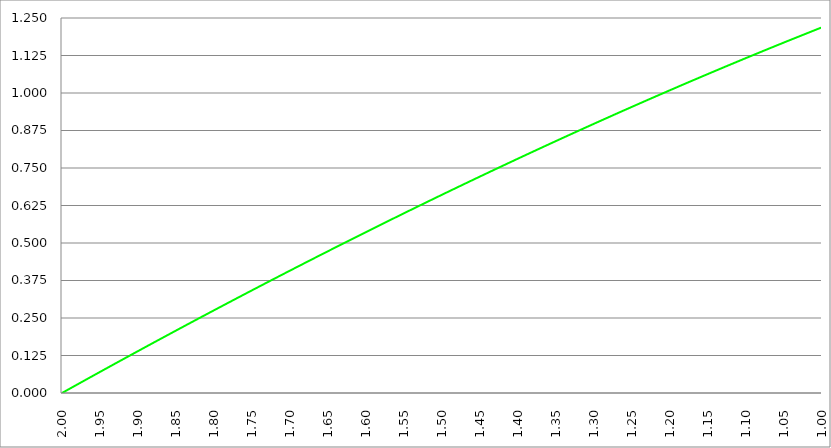
| Category | Series 1 | Series 0 | Series 2 |
|---|---|---|---|
| 2.0 |  | 0 |  |
| 1.9995 |  | 0.001 |  |
| 1.999 |  | 0.001 |  |
| 1.9985 |  | 0.002 |  |
| 1.998 |  | 0.003 |  |
| 1.9975 |  | 0.004 |  |
| 1.997 |  | 0.004 |  |
| 1.9965 |  | 0.005 |  |
| 1.996 |  | 0.006 |  |
| 1.9955 |  | 0.006 |  |
| 1.995000000000001 |  | 0.007 |  |
| 1.994500000000001 |  | 0.008 |  |
| 1.994000000000001 |  | 0.008 |  |
| 1.993500000000001 |  | 0.009 |  |
| 1.993000000000001 |  | 0.01 |  |
| 1.992500000000001 |  | 0.011 |  |
| 1.992000000000001 |  | 0.011 |  |
| 1.991500000000001 |  | 0.012 |  |
| 1.991000000000001 |  | 0.013 |  |
| 1.990500000000001 |  | 0.013 |  |
| 1.990000000000001 |  | 0.014 |  |
| 1.989500000000001 |  | 0.015 |  |
| 1.989000000000001 |  | 0.016 |  |
| 1.988500000000001 |  | 0.016 |  |
| 1.988000000000001 |  | 0.017 |  |
| 1.987500000000001 |  | 0.018 |  |
| 1.987000000000001 |  | 0.018 |  |
| 1.986500000000001 |  | 0.019 |  |
| 1.986000000000002 |  | 0.02 |  |
| 1.985500000000002 |  | 0.02 |  |
| 1.985000000000002 |  | 0.021 |  |
| 1.984500000000002 |  | 0.022 |  |
| 1.984000000000002 |  | 0.023 |  |
| 1.983500000000002 |  | 0.023 |  |
| 1.983000000000002 |  | 0.024 |  |
| 1.982500000000002 |  | 0.025 |  |
| 1.982000000000002 |  | 0.025 |  |
| 1.981500000000002 |  | 0.026 |  |
| 1.981000000000002 |  | 0.027 |  |
| 1.980500000000002 |  | 0.028 |  |
| 1.980000000000002 |  | 0.028 |  |
| 1.979500000000002 |  | 0.029 |  |
| 1.979000000000002 |  | 0.03 |  |
| 1.978500000000002 |  | 0.03 |  |
| 1.978000000000002 |  | 0.031 |  |
| 1.977500000000002 |  | 0.032 |  |
| 1.977000000000003 |  | 0.032 |  |
| 1.976500000000003 |  | 0.033 |  |
| 1.976000000000003 |  | 0.034 |  |
| 1.975500000000003 |  | 0.035 |  |
| 1.975000000000003 |  | 0.035 |  |
| 1.974500000000003 |  | 0.036 |  |
| 1.974000000000003 |  | 0.037 |  |
| 1.973500000000003 |  | 0.037 |  |
| 1.973000000000003 |  | 0.038 |  |
| 1.972500000000003 |  | 0.039 |  |
| 1.972000000000003 |  | 0.039 |  |
| 1.971500000000003 |  | 0.04 |  |
| 1.971000000000003 |  | 0.041 |  |
| 1.970500000000003 |  | 0.042 |  |
| 1.970000000000003 |  | 0.042 |  |
| 1.969500000000003 |  | 0.043 |  |
| 1.969000000000003 |  | 0.044 |  |
| 1.968500000000003 |  | 0.044 |  |
| 1.968000000000003 |  | 0.045 |  |
| 1.967500000000004 |  | 0.046 |  |
| 1.967000000000004 |  | 0.046 |  |
| 1.966500000000004 |  | 0.047 |  |
| 1.966000000000004 |  | 0.048 |  |
| 1.965500000000004 |  | 0.049 |  |
| 1.965000000000004 |  | 0.049 |  |
| 1.964500000000004 |  | 0.05 |  |
| 1.964000000000004 |  | 0.051 |  |
| 1.963500000000004 |  | 0.051 |  |
| 1.963000000000004 |  | 0.052 |  |
| 1.962500000000004 |  | 0.053 |  |
| 1.962000000000004 |  | 0.053 |  |
| 1.961500000000004 |  | 0.054 |  |
| 1.961000000000004 |  | 0.055 |  |
| 1.960500000000004 |  | 0.056 |  |
| 1.960000000000004 |  | 0.056 |  |
| 1.959500000000004 |  | 0.057 |  |
| 1.959000000000004 |  | 0.058 |  |
| 1.958500000000005 |  | 0.058 |  |
| 1.958000000000005 |  | 0.059 |  |
| 1.957500000000005 |  | 0.06 |  |
| 1.957000000000005 |  | 0.06 |  |
| 1.956500000000005 |  | 0.061 |  |
| 1.956000000000005 |  | 0.062 |  |
| 1.955500000000005 |  | 0.063 |  |
| 1.955000000000005 |  | 0.063 |  |
| 1.954500000000005 |  | 0.064 |  |
| 1.954000000000005 |  | 0.065 |  |
| 1.953500000000005 |  | 0.065 |  |
| 1.953000000000005 |  | 0.066 |  |
| 1.952500000000005 |  | 0.067 |  |
| 1.952000000000005 |  | 0.067 |  |
| 1.951500000000005 |  | 0.068 |  |
| 1.951000000000005 |  | 0.069 |  |
| 1.950500000000005 |  | 0.07 |  |
| 1.950000000000005 |  | 0.07 |  |
| 1.949500000000006 |  | 0.071 |  |
| 1.949000000000006 |  | 0.072 |  |
| 1.948500000000006 |  | 0.072 |  |
| 1.948000000000006 |  | 0.073 |  |
| 1.947500000000006 |  | 0.074 |  |
| 1.947000000000006 |  | 0.074 |  |
| 1.946500000000006 |  | 0.075 |  |
| 1.946000000000006 |  | 0.076 |  |
| 1.945500000000006 |  | 0.077 |  |
| 1.945000000000006 |  | 0.077 |  |
| 1.944500000000006 |  | 0.078 |  |
| 1.944000000000006 |  | 0.079 |  |
| 1.943500000000006 |  | 0.079 |  |
| 1.943000000000006 |  | 0.08 |  |
| 1.942500000000006 |  | 0.081 |  |
| 1.942000000000006 |  | 0.081 |  |
| 1.941500000000006 |  | 0.082 |  |
| 1.941000000000006 |  | 0.083 |  |
| 1.940500000000007 |  | 0.084 |  |
| 1.940000000000007 |  | 0.084 |  |
| 1.939500000000007 |  | 0.085 |  |
| 1.939000000000007 |  | 0.086 |  |
| 1.938500000000007 |  | 0.086 |  |
| 1.938000000000007 |  | 0.087 |  |
| 1.937500000000007 |  | 0.088 |  |
| 1.937000000000007 |  | 0.088 |  |
| 1.936500000000007 |  | 0.089 |  |
| 1.936000000000007 |  | 0.09 |  |
| 1.935500000000007 |  | 0.09 |  |
| 1.935000000000007 |  | 0.091 |  |
| 1.934500000000007 |  | 0.092 |  |
| 1.934000000000007 |  | 0.093 |  |
| 1.933500000000007 |  | 0.093 |  |
| 1.933000000000007 |  | 0.094 |  |
| 1.932500000000007 |  | 0.095 |  |
| 1.932000000000007 |  | 0.095 |  |
| 1.931500000000008 |  | 0.096 |  |
| 1.931000000000008 |  | 0.097 |  |
| 1.930500000000008 |  | 0.097 |  |
| 1.930000000000008 |  | 0.098 |  |
| 1.929500000000008 |  | 0.099 |  |
| 1.929000000000008 |  | 0.1 |  |
| 1.928500000000008 |  | 0.1 |  |
| 1.928000000000008 |  | 0.101 |  |
| 1.927500000000008 |  | 0.102 |  |
| 1.927000000000008 |  | 0.102 |  |
| 1.926500000000008 |  | 0.103 |  |
| 1.926000000000008 |  | 0.104 |  |
| 1.925500000000008 |  | 0.104 |  |
| 1.925000000000008 |  | 0.105 |  |
| 1.924500000000008 |  | 0.106 |  |
| 1.924000000000008 |  | 0.106 |  |
| 1.923500000000008 |  | 0.107 |  |
| 1.923000000000008 |  | 0.108 |  |
| 1.922500000000009 |  | 0.109 |  |
| 1.922000000000009 |  | 0.109 |  |
| 1.921500000000009 |  | 0.11 |  |
| 1.921000000000009 |  | 0.111 |  |
| 1.920500000000009 |  | 0.111 |  |
| 1.920000000000009 |  | 0.112 |  |
| 1.919500000000009 |  | 0.113 |  |
| 1.919000000000009 |  | 0.113 |  |
| 1.918500000000009 |  | 0.114 |  |
| 1.91800000000001 |  | 0.115 |  |
| 1.917500000000009 |  | 0.115 |  |
| 1.917000000000009 |  | 0.116 |  |
| 1.916500000000009 |  | 0.117 |  |
| 1.916000000000009 |  | 0.118 |  |
| 1.915500000000009 |  | 0.118 |  |
| 1.915000000000009 |  | 0.119 |  |
| 1.914500000000009 |  | 0.12 |  |
| 1.914000000000009 |  | 0.12 |  |
| 1.91350000000001 |  | 0.121 |  |
| 1.91300000000001 |  | 0.122 |  |
| 1.91250000000001 |  | 0.122 |  |
| 1.91200000000001 |  | 0.123 |  |
| 1.91150000000001 |  | 0.124 |  |
| 1.91100000000001 |  | 0.124 |  |
| 1.91050000000001 |  | 0.125 |  |
| 1.91000000000001 |  | 0.126 |  |
| 1.90950000000001 |  | 0.127 |  |
| 1.90900000000001 |  | 0.127 |  |
| 1.90850000000001 |  | 0.128 |  |
| 1.90800000000001 |  | 0.129 |  |
| 1.90750000000001 |  | 0.129 |  |
| 1.90700000000001 |  | 0.13 |  |
| 1.90650000000001 |  | 0.131 |  |
| 1.90600000000001 |  | 0.131 |  |
| 1.90550000000001 |  | 0.132 |  |
| 1.90500000000001 |  | 0.133 |  |
| 1.90450000000001 |  | 0.133 |  |
| 1.904000000000011 |  | 0.134 |  |
| 1.903500000000011 |  | 0.135 |  |
| 1.903000000000011 |  | 0.136 |  |
| 1.902500000000011 |  | 0.136 |  |
| 1.902000000000011 |  | 0.137 |  |
| 1.901500000000011 |  | 0.138 |  |
| 1.901000000000011 |  | 0.138 |  |
| 1.900500000000011 |  | 0.139 |  |
| 1.900000000000011 |  | 0.14 |  |
| 1.899500000000011 |  | 0.14 |  |
| 1.899000000000011 |  | 0.141 |  |
| 1.898500000000011 |  | 0.142 |  |
| 1.898000000000011 |  | 0.142 |  |
| 1.897500000000011 |  | 0.143 |  |
| 1.897000000000011 |  | 0.144 |  |
| 1.896500000000011 |  | 0.144 |  |
| 1.896000000000011 |  | 0.145 |  |
| 1.895500000000011 |  | 0.146 |  |
| 1.895000000000011 |  | 0.147 |  |
| 1.894500000000012 |  | 0.147 |  |
| 1.894000000000012 |  | 0.148 |  |
| 1.893500000000012 |  | 0.149 |  |
| 1.893000000000012 |  | 0.149 |  |
| 1.892500000000012 |  | 0.15 |  |
| 1.892000000000012 |  | 0.151 |  |
| 1.891500000000012 |  | 0.151 |  |
| 1.891000000000012 |  | 0.152 |  |
| 1.890500000000012 |  | 0.153 |  |
| 1.890000000000012 |  | 0.153 |  |
| 1.889500000000012 |  | 0.154 |  |
| 1.889000000000012 |  | 0.155 |  |
| 1.888500000000012 |  | 0.155 |  |
| 1.888000000000012 |  | 0.156 |  |
| 1.887500000000012 |  | 0.157 |  |
| 1.887000000000012 |  | 0.158 |  |
| 1.886500000000012 |  | 0.158 |  |
| 1.886000000000012 |  | 0.159 |  |
| 1.885500000000013 |  | 0.16 |  |
| 1.885000000000013 |  | 0.16 |  |
| 1.884500000000013 |  | 0.161 |  |
| 1.884000000000013 |  | 0.162 |  |
| 1.883500000000013 |  | 0.162 |  |
| 1.883000000000013 |  | 0.163 |  |
| 1.882500000000013 |  | 0.164 |  |
| 1.882000000000013 |  | 0.164 |  |
| 1.881500000000013 |  | 0.165 |  |
| 1.881000000000013 |  | 0.166 |  |
| 1.880500000000013 |  | 0.166 |  |
| 1.880000000000013 |  | 0.167 |  |
| 1.879500000000013 |  | 0.168 |  |
| 1.879000000000013 |  | 0.169 |  |
| 1.878500000000013 |  | 0.169 |  |
| 1.878000000000013 |  | 0.17 |  |
| 1.877500000000013 |  | 0.171 |  |
| 1.877000000000013 |  | 0.171 |  |
| 1.876500000000014 |  | 0.172 |  |
| 1.876000000000014 |  | 0.173 |  |
| 1.875500000000014 |  | 0.173 |  |
| 1.875000000000014 |  | 0.174 |  |
| 1.874500000000014 |  | 0.175 |  |
| 1.874000000000014 |  | 0.175 |  |
| 1.873500000000014 |  | 0.176 |  |
| 1.873000000000014 |  | 0.177 |  |
| 1.872500000000014 |  | 0.177 |  |
| 1.872000000000014 |  | 0.178 |  |
| 1.871500000000014 |  | 0.179 |  |
| 1.871000000000014 |  | 0.179 |  |
| 1.870500000000014 |  | 0.18 |  |
| 1.870000000000014 |  | 0.181 |  |
| 1.869500000000014 |  | 0.182 |  |
| 1.869000000000014 |  | 0.182 |  |
| 1.868500000000014 |  | 0.183 |  |
| 1.868000000000014 |  | 0.184 |  |
| 1.867500000000015 |  | 0.184 |  |
| 1.867000000000015 |  | 0.185 |  |
| 1.866500000000015 |  | 0.186 |  |
| 1.866000000000015 |  | 0.186 |  |
| 1.865500000000015 |  | 0.187 |  |
| 1.865000000000015 |  | 0.188 |  |
| 1.864500000000015 |  | 0.188 |  |
| 1.864000000000015 |  | 0.189 |  |
| 1.863500000000015 |  | 0.19 |  |
| 1.863000000000015 |  | 0.19 |  |
| 1.862500000000015 |  | 0.191 |  |
| 1.862000000000015 |  | 0.192 |  |
| 1.861500000000015 |  | 0.192 |  |
| 1.861000000000015 |  | 0.193 |  |
| 1.860500000000015 |  | 0.194 |  |
| 1.860000000000015 |  | 0.194 |  |
| 1.859500000000015 |  | 0.195 |  |
| 1.859000000000015 |  | 0.196 |  |
| 1.858500000000016 |  | 0.197 |  |
| 1.858000000000016 |  | 0.197 |  |
| 1.857500000000016 |  | 0.198 |  |
| 1.857000000000016 |  | 0.199 |  |
| 1.856500000000016 |  | 0.199 |  |
| 1.856000000000016 |  | 0.2 |  |
| 1.855500000000016 |  | 0.201 |  |
| 1.855000000000016 |  | 0.201 |  |
| 1.854500000000016 |  | 0.202 |  |
| 1.854000000000016 |  | 0.203 |  |
| 1.853500000000016 |  | 0.203 |  |
| 1.853000000000016 |  | 0.204 |  |
| 1.852500000000016 |  | 0.205 |  |
| 1.852000000000016 |  | 0.205 |  |
| 1.851500000000016 |  | 0.206 |  |
| 1.851000000000016 |  | 0.207 |  |
| 1.850500000000016 |  | 0.207 |  |
| 1.850000000000016 |  | 0.208 |  |
| 1.849500000000017 |  | 0.209 |  |
| 1.849000000000017 |  | 0.209 |  |
| 1.848500000000017 |  | 0.21 |  |
| 1.848000000000017 |  | 0.211 |  |
| 1.847500000000017 |  | 0.212 |  |
| 1.847000000000017 |  | 0.212 |  |
| 1.846500000000017 |  | 0.213 |  |
| 1.846000000000017 |  | 0.214 |  |
| 1.845500000000017 |  | 0.214 |  |
| 1.845000000000017 |  | 0.215 |  |
| 1.844500000000017 |  | 0.216 |  |
| 1.844000000000017 |  | 0.216 |  |
| 1.843500000000017 |  | 0.217 |  |
| 1.843000000000017 |  | 0.218 |  |
| 1.842500000000017 |  | 0.218 |  |
| 1.842000000000017 |  | 0.219 |  |
| 1.841500000000017 |  | 0.22 |  |
| 1.841000000000017 |  | 0.22 |  |
| 1.840500000000018 |  | 0.221 |  |
| 1.840000000000018 |  | 0.222 |  |
| 1.839500000000018 |  | 0.222 |  |
| 1.839000000000018 |  | 0.223 |  |
| 1.838500000000018 |  | 0.224 |  |
| 1.838000000000018 |  | 0.224 |  |
| 1.837500000000018 |  | 0.225 |  |
| 1.837000000000018 |  | 0.226 |  |
| 1.836500000000018 |  | 0.226 |  |
| 1.836000000000018 |  | 0.227 |  |
| 1.835500000000018 |  | 0.228 |  |
| 1.835000000000018 |  | 0.228 |  |
| 1.834500000000018 |  | 0.229 |  |
| 1.834000000000018 |  | 0.23 |  |
| 1.833500000000018 |  | 0.23 |  |
| 1.833000000000018 |  | 0.231 |  |
| 1.832500000000018 |  | 0.232 |  |
| 1.832000000000018 |  | 0.233 |  |
| 1.831500000000019 |  | 0.233 |  |
| 1.831000000000019 |  | 0.234 |  |
| 1.830500000000019 |  | 0.235 |  |
| 1.830000000000019 |  | 0.235 |  |
| 1.829500000000019 |  | 0.236 |  |
| 1.829000000000019 |  | 0.237 |  |
| 1.828500000000019 |  | 0.237 |  |
| 1.828000000000019 |  | 0.238 |  |
| 1.827500000000019 |  | 0.239 |  |
| 1.82700000000002 |  | 0.239 |  |
| 1.82650000000002 |  | 0.24 |  |
| 1.82600000000002 |  | 0.241 |  |
| 1.825500000000019 |  | 0.241 |  |
| 1.825000000000019 |  | 0.242 |  |
| 1.824500000000019 |  | 0.243 |  |
| 1.824000000000019 |  | 0.243 |  |
| 1.823500000000019 |  | 0.244 |  |
| 1.823000000000019 |  | 0.245 |  |
| 1.822500000000019 |  | 0.245 |  |
| 1.82200000000002 |  | 0.246 |  |
| 1.82150000000002 |  | 0.247 |  |
| 1.82100000000002 |  | 0.247 |  |
| 1.82050000000002 |  | 0.248 |  |
| 1.82000000000002 |  | 0.249 |  |
| 1.81950000000002 |  | 0.249 |  |
| 1.81900000000002 |  | 0.25 |  |
| 1.81850000000002 |  | 0.251 |  |
| 1.81800000000002 |  | 0.251 |  |
| 1.81750000000002 |  | 0.252 |  |
| 1.81700000000002 |  | 0.253 |  |
| 1.81650000000002 |  | 0.253 |  |
| 1.81600000000002 |  | 0.254 |  |
| 1.81550000000002 |  | 0.255 |  |
| 1.81500000000002 |  | 0.255 |  |
| 1.81450000000002 |  | 0.256 |  |
| 1.81400000000002 |  | 0.257 |  |
| 1.81350000000002 |  | 0.258 |  |
| 1.813000000000021 |  | 0.258 |  |
| 1.812500000000021 |  | 0.259 |  |
| 1.812000000000021 |  | 0.26 |  |
| 1.811500000000021 |  | 0.26 |  |
| 1.811000000000021 |  | 0.261 |  |
| 1.810500000000021 |  | 0.262 |  |
| 1.810000000000021 |  | 0.262 |  |
| 1.809500000000021 |  | 0.263 |  |
| 1.809000000000021 |  | 0.264 |  |
| 1.808500000000021 |  | 0.264 |  |
| 1.808000000000021 |  | 0.265 |  |
| 1.807500000000021 |  | 0.266 |  |
| 1.807000000000021 |  | 0.266 |  |
| 1.806500000000021 |  | 0.267 |  |
| 1.806000000000021 |  | 0.268 |  |
| 1.805500000000021 |  | 0.268 |  |
| 1.805000000000021 |  | 0.269 |  |
| 1.804500000000021 |  | 0.27 |  |
| 1.804000000000022 |  | 0.27 |  |
| 1.803500000000022 |  | 0.271 |  |
| 1.803000000000022 |  | 0.272 |  |
| 1.802500000000022 |  | 0.272 |  |
| 1.802000000000022 |  | 0.273 |  |
| 1.801500000000022 |  | 0.274 |  |
| 1.801000000000022 |  | 0.274 |  |
| 1.800500000000022 |  | 0.275 |  |
| 1.800000000000022 |  | 0.276 |  |
| 1.799500000000022 |  | 0.276 |  |
| 1.799000000000022 |  | 0.277 |  |
| 1.798500000000022 |  | 0.278 |  |
| 1.798000000000022 |  | 0.278 |  |
| 1.797500000000022 |  | 0.279 |  |
| 1.797000000000022 |  | 0.28 |  |
| 1.796500000000022 |  | 0.28 |  |
| 1.796000000000022 |  | 0.281 |  |
| 1.795500000000022 |  | 0.282 |  |
| 1.795000000000022 |  | 0.282 |  |
| 1.794500000000023 |  | 0.283 |  |
| 1.794000000000023 |  | 0.284 |  |
| 1.793500000000023 |  | 0.284 |  |
| 1.793000000000023 |  | 0.285 |  |
| 1.792500000000023 |  | 0.286 |  |
| 1.792000000000023 |  | 0.286 |  |
| 1.791500000000023 |  | 0.287 |  |
| 1.791000000000023 |  | 0.288 |  |
| 1.790500000000023 |  | 0.288 |  |
| 1.790000000000023 |  | 0.289 |  |
| 1.789500000000023 |  | 0.29 |  |
| 1.789000000000023 |  | 0.29 |  |
| 1.788500000000023 |  | 0.291 |  |
| 1.788000000000023 |  | 0.292 |  |
| 1.787500000000023 |  | 0.292 |  |
| 1.787000000000023 |  | 0.293 |  |
| 1.786500000000023 |  | 0.294 |  |
| 1.786000000000023 |  | 0.294 |  |
| 1.785500000000024 |  | 0.295 |  |
| 1.785000000000024 |  | 0.296 |  |
| 1.784500000000024 |  | 0.296 |  |
| 1.784000000000024 |  | 0.297 |  |
| 1.783500000000024 |  | 0.298 |  |
| 1.783000000000024 |  | 0.298 |  |
| 1.782500000000024 |  | 0.299 |  |
| 1.782000000000024 |  | 0.3 |  |
| 1.781500000000024 |  | 0.3 |  |
| 1.781000000000024 |  | 0.301 |  |
| 1.780500000000024 |  | 0.302 |  |
| 1.780000000000024 |  | 0.302 |  |
| 1.779500000000024 |  | 0.303 |  |
| 1.779000000000024 |  | 0.304 |  |
| 1.778500000000024 |  | 0.304 |  |
| 1.778000000000024 |  | 0.305 |  |
| 1.777500000000024 |  | 0.306 |  |
| 1.777000000000024 |  | 0.306 |  |
| 1.776500000000025 |  | 0.307 |  |
| 1.776000000000025 |  | 0.308 |  |
| 1.775500000000025 |  | 0.308 |  |
| 1.775000000000025 |  | 0.309 |  |
| 1.774500000000025 |  | 0.31 |  |
| 1.774000000000025 |  | 0.31 |  |
| 1.773500000000025 |  | 0.311 |  |
| 1.773000000000025 |  | 0.312 |  |
| 1.772500000000025 |  | 0.312 |  |
| 1.772000000000025 |  | 0.313 |  |
| 1.771500000000025 |  | 0.314 |  |
| 1.771000000000025 |  | 0.314 |  |
| 1.770500000000025 |  | 0.315 |  |
| 1.770000000000025 |  | 0.316 |  |
| 1.769500000000025 |  | 0.316 |  |
| 1.769000000000025 |  | 0.317 |  |
| 1.768500000000025 |  | 0.318 |  |
| 1.768000000000025 |  | 0.318 |  |
| 1.767500000000026 |  | 0.319 |  |
| 1.767000000000026 |  | 0.32 |  |
| 1.766500000000026 |  | 0.32 |  |
| 1.766000000000026 |  | 0.321 |  |
| 1.765500000000026 |  | 0.322 |  |
| 1.765000000000026 |  | 0.322 |  |
| 1.764500000000026 |  | 0.323 |  |
| 1.764000000000026 |  | 0.324 |  |
| 1.763500000000026 |  | 0.324 |  |
| 1.763000000000026 |  | 0.325 |  |
| 1.762500000000026 |  | 0.326 |  |
| 1.762000000000026 |  | 0.326 |  |
| 1.761500000000026 |  | 0.327 |  |
| 1.761000000000026 |  | 0.328 |  |
| 1.760500000000026 |  | 0.328 |  |
| 1.760000000000026 |  | 0.329 |  |
| 1.759500000000026 |  | 0.33 |  |
| 1.759000000000026 |  | 0.33 |  |
| 1.758500000000027 |  | 0.331 |  |
| 1.758000000000027 |  | 0.332 |  |
| 1.757500000000027 |  | 0.332 |  |
| 1.757000000000027 |  | 0.333 |  |
| 1.756500000000027 |  | 0.334 |  |
| 1.756000000000027 |  | 0.334 |  |
| 1.755500000000027 |  | 0.335 |  |
| 1.755000000000027 |  | 0.336 |  |
| 1.754500000000027 |  | 0.336 |  |
| 1.754000000000027 |  | 0.337 |  |
| 1.753500000000027 |  | 0.338 |  |
| 1.753000000000027 |  | 0.338 |  |
| 1.752500000000027 |  | 0.339 |  |
| 1.752000000000027 |  | 0.34 |  |
| 1.751500000000027 |  | 0.34 |  |
| 1.751000000000027 |  | 0.341 |  |
| 1.750500000000027 |  | 0.342 |  |
| 1.750000000000027 |  | 0.342 |  |
| 1.749500000000028 |  | 0.343 |  |
| 1.749000000000028 |  | 0.344 |  |
| 1.748500000000028 |  | 0.344 |  |
| 1.748000000000028 |  | 0.345 |  |
| 1.747500000000028 |  | 0.346 |  |
| 1.747000000000028 |  | 0.346 |  |
| 1.746500000000028 |  | 0.347 |  |
| 1.746000000000028 |  | 0.348 |  |
| 1.745500000000028 |  | 0.348 |  |
| 1.745000000000028 |  | 0.349 |  |
| 1.744500000000028 |  | 0.35 |  |
| 1.744000000000028 |  | 0.35 |  |
| 1.743500000000028 |  | 0.351 |  |
| 1.743000000000028 |  | 0.352 |  |
| 1.742500000000028 |  | 0.352 |  |
| 1.742000000000028 |  | 0.353 |  |
| 1.741500000000028 |  | 0.353 |  |
| 1.741000000000028 |  | 0.354 |  |
| 1.740500000000029 |  | 0.355 |  |
| 1.740000000000029 |  | 0.355 |  |
| 1.739500000000029 |  | 0.356 |  |
| 1.739000000000029 |  | 0.357 |  |
| 1.738500000000029 |  | 0.357 |  |
| 1.738000000000029 |  | 0.358 |  |
| 1.737500000000029 |  | 0.359 |  |
| 1.737000000000029 |  | 0.359 |  |
| 1.736500000000029 |  | 0.36 |  |
| 1.73600000000003 |  | 0.361 |  |
| 1.73550000000003 |  | 0.361 |  |
| 1.73500000000003 |  | 0.362 |  |
| 1.73450000000003 |  | 0.363 |  |
| 1.73400000000003 |  | 0.363 |  |
| 1.733500000000029 |  | 0.364 |  |
| 1.733000000000029 |  | 0.365 |  |
| 1.732500000000029 |  | 0.365 |  |
| 1.732000000000029 |  | 0.366 |  |
| 1.731500000000029 |  | 0.367 |  |
| 1.73100000000003 |  | 0.367 |  |
| 1.73050000000003 |  | 0.368 |  |
| 1.73000000000003 |  | 0.369 |  |
| 1.72950000000003 |  | 0.369 |  |
| 1.72900000000003 |  | 0.37 |  |
| 1.72850000000003 |  | 0.371 |  |
| 1.72800000000003 |  | 0.371 |  |
| 1.72750000000003 |  | 0.372 |  |
| 1.72700000000003 |  | 0.373 |  |
| 1.72650000000003 |  | 0.373 |  |
| 1.72600000000003 |  | 0.374 |  |
| 1.72550000000003 |  | 0.375 |  |
| 1.72500000000003 |  | 0.375 |  |
| 1.72450000000003 |  | 0.376 |  |
| 1.72400000000003 |  | 0.377 |  |
| 1.72350000000003 |  | 0.377 |  |
| 1.72300000000003 |  | 0.378 |  |
| 1.72250000000003 |  | 0.378 |  |
| 1.722000000000031 |  | 0.379 |  |
| 1.721500000000031 |  | 0.38 |  |
| 1.721000000000031 |  | 0.38 |  |
| 1.720500000000031 |  | 0.381 |  |
| 1.720000000000031 |  | 0.382 |  |
| 1.719500000000031 |  | 0.382 |  |
| 1.719000000000031 |  | 0.383 |  |
| 1.718500000000031 |  | 0.384 |  |
| 1.718000000000031 |  | 0.384 |  |
| 1.717500000000031 |  | 0.385 |  |
| 1.717000000000031 |  | 0.386 |  |
| 1.716500000000031 |  | 0.386 |  |
| 1.716000000000031 |  | 0.387 |  |
| 1.715500000000031 |  | 0.388 |  |
| 1.715000000000031 |  | 0.388 |  |
| 1.714500000000031 |  | 0.389 |  |
| 1.714000000000031 |  | 0.39 |  |
| 1.713500000000031 |  | 0.39 |  |
| 1.713000000000032 |  | 0.391 |  |
| 1.712500000000032 |  | 0.392 |  |
| 1.712000000000032 |  | 0.392 |  |
| 1.711500000000032 |  | 0.393 |  |
| 1.711000000000032 |  | 0.394 |  |
| 1.710500000000032 |  | 0.394 |  |
| 1.710000000000032 |  | 0.395 |  |
| 1.709500000000032 |  | 0.396 |  |
| 1.709000000000032 |  | 0.396 |  |
| 1.708500000000032 |  | 0.397 |  |
| 1.708000000000032 |  | 0.397 |  |
| 1.707500000000032 |  | 0.398 |  |
| 1.707000000000032 |  | 0.399 |  |
| 1.706500000000032 |  | 0.399 |  |
| 1.706000000000032 |  | 0.4 |  |
| 1.705500000000032 |  | 0.401 |  |
| 1.705000000000032 |  | 0.401 |  |
| 1.704500000000032 |  | 0.402 |  |
| 1.704000000000033 |  | 0.403 |  |
| 1.703500000000033 |  | 0.403 |  |
| 1.703000000000033 |  | 0.404 |  |
| 1.702500000000033 |  | 0.405 |  |
| 1.702000000000033 |  | 0.405 |  |
| 1.701500000000033 |  | 0.406 |  |
| 1.701000000000033 |  | 0.407 |  |
| 1.700500000000033 |  | 0.407 |  |
| 1.700000000000033 |  | 0.408 |  |
| 1.699500000000033 |  | 0.409 |  |
| 1.699000000000033 |  | 0.409 |  |
| 1.698500000000033 |  | 0.41 |  |
| 1.698000000000033 |  | 0.411 |  |
| 1.697500000000033 |  | 0.411 |  |
| 1.697000000000033 |  | 0.412 |  |
| 1.696500000000033 |  | 0.412 |  |
| 1.696000000000033 |  | 0.413 |  |
| 1.695500000000033 |  | 0.414 |  |
| 1.695000000000033 |  | 0.414 |  |
| 1.694500000000034 |  | 0.415 |  |
| 1.694000000000034 |  | 0.416 |  |
| 1.693500000000034 |  | 0.416 |  |
| 1.693000000000034 |  | 0.417 |  |
| 1.692500000000034 |  | 0.418 |  |
| 1.692000000000034 |  | 0.418 |  |
| 1.691500000000034 |  | 0.419 |  |
| 1.691000000000034 |  | 0.42 |  |
| 1.690500000000034 |  | 0.42 |  |
| 1.690000000000034 |  | 0.421 |  |
| 1.689500000000034 |  | 0.422 |  |
| 1.689000000000034 |  | 0.422 |  |
| 1.688500000000034 |  | 0.423 |  |
| 1.688000000000034 |  | 0.424 |  |
| 1.687500000000034 |  | 0.424 |  |
| 1.687000000000034 |  | 0.425 |  |
| 1.686500000000034 |  | 0.425 |  |
| 1.686000000000034 |  | 0.426 |  |
| 1.685500000000035 |  | 0.427 |  |
| 1.685000000000035 |  | 0.427 |  |
| 1.684500000000035 |  | 0.428 |  |
| 1.684000000000035 |  | 0.429 |  |
| 1.683500000000035 |  | 0.429 |  |
| 1.683000000000035 |  | 0.43 |  |
| 1.682500000000035 |  | 0.431 |  |
| 1.682000000000035 |  | 0.431 |  |
| 1.681500000000035 |  | 0.432 |  |
| 1.681000000000035 |  | 0.433 |  |
| 1.680500000000035 |  | 0.433 |  |
| 1.680000000000035 |  | 0.434 |  |
| 1.679500000000035 |  | 0.435 |  |
| 1.679000000000035 |  | 0.435 |  |
| 1.678500000000035 |  | 0.436 |  |
| 1.678000000000035 |  | 0.437 |  |
| 1.677500000000035 |  | 0.437 |  |
| 1.677000000000035 |  | 0.438 |  |
| 1.676500000000036 |  | 0.438 |  |
| 1.676000000000036 |  | 0.439 |  |
| 1.675500000000036 |  | 0.44 |  |
| 1.675000000000036 |  | 0.44 |  |
| 1.674500000000036 |  | 0.441 |  |
| 1.674000000000036 |  | 0.442 |  |
| 1.673500000000036 |  | 0.442 |  |
| 1.673000000000036 |  | 0.443 |  |
| 1.672500000000036 |  | 0.444 |  |
| 1.672000000000036 |  | 0.444 |  |
| 1.671500000000036 |  | 0.445 |  |
| 1.671000000000036 |  | 0.446 |  |
| 1.670500000000036 |  | 0.446 |  |
| 1.670000000000036 |  | 0.447 |  |
| 1.669500000000036 |  | 0.448 |  |
| 1.669000000000036 |  | 0.448 |  |
| 1.668500000000036 |  | 0.449 |  |
| 1.668000000000036 |  | 0.449 |  |
| 1.667500000000037 |  | 0.45 |  |
| 1.667000000000037 |  | 0.451 |  |
| 1.666500000000037 |  | 0.451 |  |
| 1.666000000000037 |  | 0.452 |  |
| 1.665500000000037 |  | 0.453 |  |
| 1.665000000000037 |  | 0.453 |  |
| 1.664500000000037 |  | 0.454 |  |
| 1.664000000000037 |  | 0.455 |  |
| 1.663500000000037 |  | 0.455 |  |
| 1.663000000000037 |  | 0.456 |  |
| 1.662500000000037 |  | 0.457 |  |
| 1.662000000000037 |  | 0.457 |  |
| 1.661500000000037 |  | 0.458 |  |
| 1.661000000000037 |  | 0.458 |  |
| 1.660500000000037 |  | 0.459 |  |
| 1.660000000000037 |  | 0.46 |  |
| 1.659500000000037 |  | 0.46 |  |
| 1.659000000000037 |  | 0.461 |  |
| 1.658500000000038 |  | 0.462 |  |
| 1.658000000000038 |  | 0.462 |  |
| 1.657500000000038 |  | 0.463 |  |
| 1.657000000000038 |  | 0.464 |  |
| 1.656500000000038 |  | 0.464 |  |
| 1.656000000000038 |  | 0.465 |  |
| 1.655500000000038 |  | 0.466 |  |
| 1.655000000000038 |  | 0.466 |  |
| 1.654500000000038 |  | 0.467 |  |
| 1.654000000000038 |  | 0.468 |  |
| 1.653500000000038 |  | 0.468 |  |
| 1.653000000000038 |  | 0.469 |  |
| 1.652500000000038 |  | 0.469 |  |
| 1.652000000000038 |  | 0.47 |  |
| 1.651500000000038 |  | 0.471 |  |
| 1.651000000000038 |  | 0.471 |  |
| 1.650500000000038 |  | 0.472 |  |
| 1.650000000000038 |  | 0.473 |  |
| 1.649500000000039 |  | 0.473 |  |
| 1.649000000000039 |  | 0.474 |  |
| 1.648500000000039 |  | 0.475 |  |
| 1.648000000000039 |  | 0.475 |  |
| 1.647500000000039 |  | 0.476 |  |
| 1.647000000000039 |  | 0.476 |  |
| 1.646500000000039 |  | 0.477 |  |
| 1.646000000000039 |  | 0.478 |  |
| 1.645500000000039 |  | 0.478 |  |
| 1.64500000000004 |  | 0.479 |  |
| 1.64450000000004 |  | 0.48 |  |
| 1.64400000000004 |  | 0.48 |  |
| 1.643500000000039 |  | 0.481 |  |
| 1.643000000000039 |  | 0.482 |  |
| 1.642500000000039 |  | 0.482 |  |
| 1.642000000000039 |  | 0.483 |  |
| 1.641500000000039 |  | 0.484 |  |
| 1.641000000000039 |  | 0.484 |  |
| 1.640500000000039 |  | 0.485 |  |
| 1.64000000000004 |  | 0.485 |  |
| 1.63950000000004 |  | 0.486 |  |
| 1.63900000000004 |  | 0.487 |  |
| 1.63850000000004 |  | 0.487 |  |
| 1.63800000000004 |  | 0.488 |  |
| 1.63750000000004 |  | 0.489 |  |
| 1.63700000000004 |  | 0.489 |  |
| 1.63650000000004 |  | 0.49 |  |
| 1.63600000000004 |  | 0.491 |  |
| 1.63550000000004 |  | 0.491 |  |
| 1.63500000000004 |  | 0.492 |  |
| 1.63450000000004 |  | 0.493 |  |
| 1.63400000000004 |  | 0.493 |  |
| 1.63350000000004 |  | 0.494 |  |
| 1.63300000000004 |  | 0.494 |  |
| 1.63250000000004 |  | 0.495 |  |
| 1.63200000000004 |  | 0.496 |  |
| 1.63150000000004 |  | 0.496 |  |
| 1.631000000000041 |  | 0.497 |  |
| 1.630500000000041 |  | 0.498 |  |
| 1.630000000000041 |  | 0.498 |  |
| 1.629500000000041 |  | 0.499 |  |
| 1.629000000000041 |  | 0.5 |  |
| 1.628500000000041 |  | 0.5 |  |
| 1.628000000000041 |  | 0.501 |  |
| 1.627500000000041 |  | 0.501 |  |
| 1.627000000000041 |  | 0.502 |  |
| 1.626500000000041 |  | 0.503 |  |
| 1.626000000000041 |  | 0.503 |  |
| 1.625500000000041 |  | 0.504 |  |
| 1.625000000000041 |  | 0.505 |  |
| 1.624500000000041 |  | 0.505 |  |
| 1.624000000000041 |  | 0.506 |  |
| 1.623500000000041 |  | 0.507 |  |
| 1.623000000000041 |  | 0.507 |  |
| 1.622500000000041 |  | 0.508 |  |
| 1.622000000000042 |  | 0.508 |  |
| 1.621500000000042 |  | 0.509 |  |
| 1.621000000000042 |  | 0.51 |  |
| 1.620500000000042 |  | 0.51 |  |
| 1.620000000000042 |  | 0.511 |  |
| 1.619500000000042 |  | 0.512 |  |
| 1.619000000000042 |  | 0.512 |  |
| 1.618500000000042 |  | 0.513 |  |
| 1.618000000000042 |  | 0.514 |  |
| 1.617500000000042 |  | 0.514 |  |
| 1.617000000000042 |  | 0.515 |  |
| 1.616500000000042 |  | 0.515 |  |
| 1.616000000000042 |  | 0.516 |  |
| 1.615500000000042 |  | 0.517 |  |
| 1.615000000000042 |  | 0.517 |  |
| 1.614500000000042 |  | 0.518 |  |
| 1.614000000000042 |  | 0.519 |  |
| 1.613500000000042 |  | 0.519 |  |
| 1.613000000000043 |  | 0.52 |  |
| 1.612500000000043 |  | 0.521 |  |
| 1.612000000000043 |  | 0.521 |  |
| 1.611500000000043 |  | 0.522 |  |
| 1.611000000000043 |  | 0.522 |  |
| 1.610500000000043 |  | 0.523 |  |
| 1.610000000000043 |  | 0.524 |  |
| 1.609500000000043 |  | 0.524 |  |
| 1.609000000000043 |  | 0.525 |  |
| 1.608500000000043 |  | 0.526 |  |
| 1.608000000000043 |  | 0.526 |  |
| 1.607500000000043 |  | 0.527 |  |
| 1.607000000000043 |  | 0.528 |  |
| 1.606500000000043 |  | 0.528 |  |
| 1.606000000000043 |  | 0.529 |  |
| 1.605500000000043 |  | 0.529 |  |
| 1.605000000000043 |  | 0.53 |  |
| 1.604500000000043 |  | 0.531 |  |
| 1.604000000000044 |  | 0.531 |  |
| 1.603500000000044 |  | 0.532 |  |
| 1.603000000000044 |  | 0.533 |  |
| 1.602500000000044 |  | 0.533 |  |
| 1.602000000000044 |  | 0.534 |  |
| 1.601500000000044 |  | 0.534 |  |
| 1.601000000000044 |  | 0.535 |  |
| 1.600500000000044 |  | 0.536 |  |
| 1.600000000000044 |  | 0.536 |  |
| 1.599500000000044 |  | 0.537 |  |
| 1.599000000000044 |  | 0.538 |  |
| 1.598500000000044 |  | 0.538 |  |
| 1.598000000000044 |  | 0.539 |  |
| 1.597500000000044 |  | 0.54 |  |
| 1.597000000000044 |  | 0.54 |  |
| 1.596500000000044 |  | 0.541 |  |
| 1.596000000000044 |  | 0.541 |  |
| 1.595500000000045 |  | 0.542 |  |
| 1.595000000000045 |  | 0.543 |  |
| 1.594500000000045 |  | 0.543 |  |
| 1.594000000000045 |  | 0.544 |  |
| 1.593500000000045 |  | 0.545 |  |
| 1.593000000000045 |  | 0.545 |  |
| 1.592500000000045 |  | 0.546 |  |
| 1.592000000000045 |  | 0.546 |  |
| 1.591500000000045 |  | 0.547 |  |
| 1.591000000000045 |  | 0.548 |  |
| 1.590500000000045 |  | 0.548 |  |
| 1.590000000000045 |  | 0.549 |  |
| 1.589500000000045 |  | 0.55 |  |
| 1.589000000000045 |  | 0.55 |  |
| 1.588500000000045 |  | 0.551 |  |
| 1.588000000000045 |  | 0.552 |  |
| 1.587500000000045 |  | 0.552 |  |
| 1.587000000000045 |  | 0.553 |  |
| 1.586500000000046 |  | 0.553 |  |
| 1.586000000000046 |  | 0.554 |  |
| 1.585500000000046 |  | 0.555 |  |
| 1.585000000000046 |  | 0.555 |  |
| 1.584500000000046 |  | 0.556 |  |
| 1.584000000000046 |  | 0.557 |  |
| 1.583500000000046 |  | 0.557 |  |
| 1.583000000000046 |  | 0.558 |  |
| 1.582500000000046 |  | 0.558 |  |
| 1.582000000000046 |  | 0.559 |  |
| 1.581500000000046 |  | 0.56 |  |
| 1.581000000000046 |  | 0.56 |  |
| 1.580500000000046 |  | 0.561 |  |
| 1.580000000000046 |  | 0.562 |  |
| 1.579500000000046 |  | 0.562 |  |
| 1.579000000000046 |  | 0.563 |  |
| 1.578500000000046 |  | 0.563 |  |
| 1.578000000000046 |  | 0.564 |  |
| 1.577500000000047 |  | 0.565 |  |
| 1.577000000000047 |  | 0.565 |  |
| 1.576500000000047 |  | 0.566 |  |
| 1.576000000000047 |  | 0.567 |  |
| 1.575500000000047 |  | 0.567 |  |
| 1.575000000000047 |  | 0.568 |  |
| 1.574500000000047 |  | 0.569 |  |
| 1.574000000000047 |  | 0.569 |  |
| 1.573500000000047 |  | 0.57 |  |
| 1.573000000000047 |  | 0.57 |  |
| 1.572500000000047 |  | 0.571 |  |
| 1.572000000000047 |  | 0.572 |  |
| 1.571500000000047 |  | 0.572 |  |
| 1.571000000000047 |  | 0.573 |  |
| 1.570500000000047 |  | 0.574 |  |
| 1.570000000000047 |  | 0.574 |  |
| 1.569500000000047 |  | 0.575 |  |
| 1.569000000000047 |  | 0.575 |  |
| 1.568500000000048 |  | 0.576 |  |
| 1.568000000000048 |  | 0.577 |  |
| 1.567500000000048 |  | 0.577 |  |
| 1.567000000000048 |  | 0.578 |  |
| 1.566500000000048 |  | 0.579 |  |
| 1.566000000000048 |  | 0.579 |  |
| 1.565500000000048 |  | 0.58 |  |
| 1.565000000000048 |  | 0.58 |  |
| 1.564500000000048 |  | 0.581 |  |
| 1.564000000000048 |  | 0.582 |  |
| 1.563500000000048 |  | 0.582 |  |
| 1.563000000000048 |  | 0.583 |  |
| 1.562500000000048 |  | 0.584 |  |
| 1.562000000000048 |  | 0.584 |  |
| 1.561500000000048 |  | 0.585 |  |
| 1.561000000000048 |  | 0.585 |  |
| 1.560500000000048 |  | 0.586 |  |
| 1.560000000000048 |  | 0.587 |  |
| 1.559500000000049 |  | 0.587 |  |
| 1.559000000000049 |  | 0.588 |  |
| 1.558500000000049 |  | 0.589 |  |
| 1.558000000000049 |  | 0.589 |  |
| 1.557500000000049 |  | 0.59 |  |
| 1.557000000000049 |  | 0.59 |  |
| 1.556500000000049 |  | 0.591 |  |
| 1.556000000000049 |  | 0.592 |  |
| 1.555500000000049 |  | 0.592 |  |
| 1.555000000000049 |  | 0.593 |  |
| 1.55450000000005 |  | 0.594 |  |
| 1.55400000000005 |  | 0.594 |  |
| 1.553500000000049 |  | 0.595 |  |
| 1.553000000000049 |  | 0.595 |  |
| 1.552500000000049 |  | 0.596 |  |
| 1.552000000000049 |  | 0.597 |  |
| 1.551500000000049 |  | 0.597 |  |
| 1.551000000000049 |  | 0.598 |  |
| 1.550500000000049 |  | 0.599 |  |
| 1.55000000000005 |  | 0.599 |  |
| 1.54950000000005 |  | 0.6 |  |
| 1.54900000000005 |  | 0.6 |  |
| 1.54850000000005 |  | 0.601 |  |
| 1.54800000000005 |  | 0.602 |  |
| 1.54750000000005 |  | 0.602 |  |
| 1.54700000000005 |  | 0.603 |  |
| 1.54650000000005 |  | 0.603 |  |
| 1.54600000000005 |  | 0.604 |  |
| 1.54550000000005 |  | 0.605 |  |
| 1.54500000000005 |  | 0.605 |  |
| 1.54450000000005 |  | 0.606 |  |
| 1.54400000000005 |  | 0.607 |  |
| 1.54350000000005 |  | 0.607 |  |
| 1.54300000000005 |  | 0.608 |  |
| 1.54250000000005 |  | 0.608 |  |
| 1.54200000000005 |  | 0.609 |  |
| 1.54150000000005 |  | 0.61 |  |
| 1.541000000000051 |  | 0.61 |  |
| 1.540500000000051 |  | 0.611 |  |
| 1.540000000000051 |  | 0.612 |  |
| 1.539500000000051 |  | 0.612 |  |
| 1.539000000000051 |  | 0.613 |  |
| 1.538500000000051 |  | 0.613 |  |
| 1.538000000000051 |  | 0.614 |  |
| 1.537500000000051 |  | 0.615 |  |
| 1.537000000000051 |  | 0.615 |  |
| 1.536500000000051 |  | 0.616 |  |
| 1.536000000000051 |  | 0.617 |  |
| 1.535500000000051 |  | 0.617 |  |
| 1.535000000000051 |  | 0.618 |  |
| 1.534500000000051 |  | 0.618 |  |
| 1.534000000000051 |  | 0.619 |  |
| 1.533500000000051 |  | 0.62 |  |
| 1.533000000000051 |  | 0.62 |  |
| 1.532500000000051 |  | 0.621 |  |
| 1.532000000000052 |  | 0.621 |  |
| 1.531500000000052 |  | 0.622 |  |
| 1.531000000000052 |  | 0.623 |  |
| 1.530500000000052 |  | 0.623 |  |
| 1.530000000000052 |  | 0.624 |  |
| 1.529500000000052 |  | 0.625 |  |
| 1.529000000000052 |  | 0.625 |  |
| 1.528500000000052 |  | 0.626 |  |
| 1.528000000000052 |  | 0.626 |  |
| 1.527500000000052 |  | 0.627 |  |
| 1.527000000000052 |  | 0.628 |  |
| 1.526500000000052 |  | 0.628 |  |
| 1.526000000000052 |  | 0.629 |  |
| 1.525500000000052 |  | 0.63 |  |
| 1.525000000000052 |  | 0.63 |  |
| 1.524500000000052 |  | 0.631 |  |
| 1.524000000000052 |  | 0.631 |  |
| 1.523500000000052 |  | 0.632 |  |
| 1.523000000000053 |  | 0.633 |  |
| 1.522500000000053 |  | 0.633 |  |
| 1.522000000000053 |  | 0.634 |  |
| 1.521500000000053 |  | 0.634 |  |
| 1.521000000000053 |  | 0.635 |  |
| 1.520500000000053 |  | 0.636 |  |
| 1.520000000000053 |  | 0.636 |  |
| 1.519500000000053 |  | 0.637 |  |
| 1.519000000000053 |  | 0.638 |  |
| 1.518500000000053 |  | 0.638 |  |
| 1.518000000000053 |  | 0.639 |  |
| 1.517500000000053 |  | 0.639 |  |
| 1.517000000000053 |  | 0.64 |  |
| 1.516500000000053 |  | 0.641 |  |
| 1.516000000000053 |  | 0.641 |  |
| 1.515500000000053 |  | 0.642 |  |
| 1.515000000000053 |  | 0.642 |  |
| 1.514500000000053 |  | 0.643 |  |
| 1.514000000000054 |  | 0.644 |  |
| 1.513500000000054 |  | 0.644 |  |
| 1.513000000000054 |  | 0.645 |  |
| 1.512500000000054 |  | 0.646 |  |
| 1.512000000000054 |  | 0.646 |  |
| 1.511500000000054 |  | 0.647 |  |
| 1.511000000000054 |  | 0.647 |  |
| 1.510500000000054 |  | 0.648 |  |
| 1.510000000000054 |  | 0.649 |  |
| 1.509500000000054 |  | 0.649 |  |
| 1.509000000000054 |  | 0.65 |  |
| 1.508500000000054 |  | 0.65 |  |
| 1.508000000000054 |  | 0.651 |  |
| 1.507500000000054 |  | 0.652 |  |
| 1.507000000000054 |  | 0.652 |  |
| 1.506500000000054 |  | 0.653 |  |
| 1.506000000000054 |  | 0.654 |  |
| 1.505500000000054 |  | 0.654 |  |
| 1.505000000000055 |  | 0.655 |  |
| 1.504500000000055 |  | 0.655 |  |
| 1.504000000000055 |  | 0.656 |  |
| 1.503500000000055 |  | 0.657 |  |
| 1.503000000000055 |  | 0.657 |  |
| 1.502500000000055 |  | 0.658 |  |
| 1.502000000000055 |  | 0.658 |  |
| 1.501500000000055 |  | 0.659 |  |
| 1.501000000000055 |  | 0.66 |  |
| 1.500500000000055 |  | 0.66 |  |
| 1.500000000000055 |  | 0.661 |  |
| 1.499500000000055 |  | 0.661 |  |
| 1.499000000000055 |  | 0.662 |  |
| 1.498500000000055 |  | 0.663 |  |
| 1.498000000000055 |  | 0.663 |  |
| 1.497500000000055 |  | 0.664 |  |
| 1.497000000000055 |  | 0.665 |  |
| 1.496500000000055 |  | 0.665 |  |
| 1.496000000000055 |  | 0.666 |  |
| 1.495500000000056 |  | 0.666 |  |
| 1.495000000000056 |  | 0.667 |  |
| 1.494500000000056 |  | 0.668 |  |
| 1.494000000000056 |  | 0.668 |  |
| 1.493500000000056 |  | 0.669 |  |
| 1.493000000000056 |  | 0.669 |  |
| 1.492500000000056 |  | 0.67 |  |
| 1.492000000000056 |  | 0.671 |  |
| 1.491500000000056 |  | 0.671 |  |
| 1.491000000000056 |  | 0.672 |  |
| 1.490500000000056 |  | 0.672 |  |
| 1.490000000000056 |  | 0.673 |  |
| 1.489500000000056 |  | 0.674 |  |
| 1.489000000000056 |  | 0.674 |  |
| 1.488500000000056 |  | 0.675 |  |
| 1.488000000000056 |  | 0.676 |  |
| 1.487500000000056 |  | 0.676 |  |
| 1.487000000000056 |  | 0.677 |  |
| 1.486500000000057 |  | 0.677 |  |
| 1.486000000000057 |  | 0.678 |  |
| 1.485500000000057 |  | 0.679 |  |
| 1.485000000000057 |  | 0.679 |  |
| 1.484500000000057 |  | 0.68 |  |
| 1.484000000000057 |  | 0.68 |  |
| 1.483500000000057 |  | 0.681 |  |
| 1.483000000000057 |  | 0.682 |  |
| 1.482500000000057 |  | 0.682 |  |
| 1.482000000000057 |  | 0.683 |  |
| 1.481500000000057 |  | 0.683 |  |
| 1.481000000000057 |  | 0.684 |  |
| 1.480500000000057 |  | 0.685 |  |
| 1.480000000000057 |  | 0.685 |  |
| 1.479500000000057 |  | 0.686 |  |
| 1.479000000000057 |  | 0.687 |  |
| 1.478500000000057 |  | 0.687 |  |
| 1.478000000000057 |  | 0.688 |  |
| 1.477500000000058 |  | 0.688 |  |
| 1.477000000000058 |  | 0.689 |  |
| 1.476500000000058 |  | 0.69 |  |
| 1.476000000000058 |  | 0.69 |  |
| 1.475500000000058 |  | 0.691 |  |
| 1.475000000000058 |  | 0.691 |  |
| 1.474500000000058 |  | 0.692 |  |
| 1.474000000000058 |  | 0.693 |  |
| 1.473500000000058 |  | 0.693 |  |
| 1.473000000000058 |  | 0.694 |  |
| 1.472500000000058 |  | 0.694 |  |
| 1.472000000000058 |  | 0.695 |  |
| 1.471500000000058 |  | 0.696 |  |
| 1.471000000000058 |  | 0.696 |  |
| 1.470500000000058 |  | 0.697 |  |
| 1.470000000000058 |  | 0.697 |  |
| 1.469500000000058 |  | 0.698 |  |
| 1.469000000000058 |  | 0.699 |  |
| 1.468500000000059 |  | 0.699 |  |
| 1.468000000000059 |  | 0.7 |  |
| 1.467500000000059 |  | 0.7 |  |
| 1.467000000000059 |  | 0.701 |  |
| 1.466500000000059 |  | 0.702 |  |
| 1.466000000000059 |  | 0.702 |  |
| 1.465500000000059 |  | 0.703 |  |
| 1.465000000000059 |  | 0.703 |  |
| 1.464500000000059 |  | 0.704 |  |
| 1.464000000000059 |  | 0.705 |  |
| 1.463500000000059 |  | 0.705 |  |
| 1.463000000000059 |  | 0.706 |  |
| 1.462500000000059 |  | 0.707 |  |
| 1.462000000000059 |  | 0.707 |  |
| 1.461500000000059 |  | 0.708 |  |
| 1.461000000000059 |  | 0.708 |  |
| 1.460500000000059 |  | 0.709 |  |
| 1.460000000000059 |  | 0.71 |  |
| 1.459500000000059 |  | 0.71 |  |
| 1.45900000000006 |  | 0.711 |  |
| 1.45850000000006 |  | 0.711 |  |
| 1.45800000000006 |  | 0.712 |  |
| 1.45750000000006 |  | 0.713 |  |
| 1.45700000000006 |  | 0.713 |  |
| 1.45650000000006 |  | 0.714 |  |
| 1.45600000000006 |  | 0.714 |  |
| 1.45550000000006 |  | 0.715 |  |
| 1.45500000000006 |  | 0.716 |  |
| 1.45450000000006 |  | 0.716 |  |
| 1.45400000000006 |  | 0.717 |  |
| 1.45350000000006 |  | 0.717 |  |
| 1.45300000000006 |  | 0.718 |  |
| 1.45250000000006 |  | 0.719 |  |
| 1.45200000000006 |  | 0.719 |  |
| 1.45150000000006 |  | 0.72 |  |
| 1.45100000000006 |  | 0.72 |  |
| 1.45050000000006 |  | 0.721 |  |
| 1.450000000000061 |  | 0.722 |  |
| 1.449500000000061 |  | 0.722 |  |
| 1.449000000000061 |  | 0.723 |  |
| 1.448500000000061 |  | 0.723 |  |
| 1.448000000000061 |  | 0.724 |  |
| 1.447500000000061 |  | 0.725 |  |
| 1.447000000000061 |  | 0.725 |  |
| 1.446500000000061 |  | 0.726 |  |
| 1.446000000000061 |  | 0.726 |  |
| 1.445500000000061 |  | 0.727 |  |
| 1.445000000000061 |  | 0.728 |  |
| 1.444500000000061 |  | 0.728 |  |
| 1.444000000000061 |  | 0.729 |  |
| 1.443500000000061 |  | 0.729 |  |
| 1.443000000000061 |  | 0.73 |  |
| 1.442500000000061 |  | 0.731 |  |
| 1.442000000000061 |  | 0.731 |  |
| 1.441500000000061 |  | 0.732 |  |
| 1.441000000000062 |  | 0.732 |  |
| 1.440500000000062 |  | 0.733 |  |
| 1.440000000000062 |  | 0.734 |  |
| 1.439500000000062 |  | 0.734 |  |
| 1.439000000000062 |  | 0.735 |  |
| 1.438500000000062 |  | 0.735 |  |
| 1.438000000000062 |  | 0.736 |  |
| 1.437500000000062 |  | 0.737 |  |
| 1.437000000000062 |  | 0.737 |  |
| 1.436500000000062 |  | 0.738 |  |
| 1.436000000000062 |  | 0.738 |  |
| 1.435500000000062 |  | 0.739 |  |
| 1.435000000000062 |  | 0.74 |  |
| 1.434500000000062 |  | 0.74 |  |
| 1.434000000000062 |  | 0.741 |  |
| 1.433500000000062 |  | 0.741 |  |
| 1.433000000000062 |  | 0.742 |  |
| 1.432500000000062 |  | 0.743 |  |
| 1.432000000000063 |  | 0.743 |  |
| 1.431500000000063 |  | 0.744 |  |
| 1.431000000000063 |  | 0.744 |  |
| 1.430500000000063 |  | 0.745 |  |
| 1.430000000000063 |  | 0.746 |  |
| 1.429500000000063 |  | 0.746 |  |
| 1.429000000000063 |  | 0.747 |  |
| 1.428500000000063 |  | 0.747 |  |
| 1.428000000000063 |  | 0.748 |  |
| 1.427500000000063 |  | 0.749 |  |
| 1.427000000000063 |  | 0.749 |  |
| 1.426500000000063 |  | 0.75 |  |
| 1.426000000000063 |  | 0.75 |  |
| 1.425500000000063 |  | 0.751 |  |
| 1.425000000000063 |  | 0.752 |  |
| 1.424500000000063 |  | 0.752 |  |
| 1.424000000000063 |  | 0.753 |  |
| 1.423500000000063 |  | 0.753 |  |
| 1.423000000000064 |  | 0.754 |  |
| 1.422500000000064 |  | 0.755 |  |
| 1.422000000000064 |  | 0.755 |  |
| 1.421500000000064 |  | 0.756 |  |
| 1.421000000000064 |  | 0.756 |  |
| 1.420500000000064 |  | 0.757 |  |
| 1.420000000000064 |  | 0.758 |  |
| 1.419500000000064 |  | 0.758 |  |
| 1.419000000000064 |  | 0.759 |  |
| 1.418500000000064 |  | 0.759 |  |
| 1.418000000000064 |  | 0.76 |  |
| 1.417500000000064 |  | 0.761 |  |
| 1.417000000000064 |  | 0.761 |  |
| 1.416500000000064 |  | 0.762 |  |
| 1.416000000000064 |  | 0.762 |  |
| 1.415500000000064 |  | 0.763 |  |
| 1.415000000000064 |  | 0.763 |  |
| 1.414500000000064 |  | 0.764 |  |
| 1.414000000000065 |  | 0.765 |  |
| 1.413500000000065 |  | 0.765 |  |
| 1.413000000000065 |  | 0.766 |  |
| 1.412500000000065 |  | 0.766 |  |
| 1.412000000000065 |  | 0.767 |  |
| 1.411500000000065 |  | 0.768 |  |
| 1.411000000000065 |  | 0.768 |  |
| 1.410500000000065 |  | 0.769 |  |
| 1.410000000000065 |  | 0.769 |  |
| 1.409500000000065 |  | 0.77 |  |
| 1.409000000000065 |  | 0.771 |  |
| 1.408500000000065 |  | 0.771 |  |
| 1.408000000000065 |  | 0.772 |  |
| 1.407500000000065 |  | 0.772 |  |
| 1.407000000000065 |  | 0.773 |  |
| 1.406500000000065 |  | 0.774 |  |
| 1.406000000000065 |  | 0.774 |  |
| 1.405500000000065 |  | 0.775 |  |
| 1.405000000000066 |  | 0.775 |  |
| 1.404500000000066 |  | 0.776 |  |
| 1.404000000000066 |  | 0.777 |  |
| 1.403500000000066 |  | 0.777 |  |
| 1.403000000000066 |  | 0.778 |  |
| 1.402500000000066 |  | 0.778 |  |
| 1.402000000000066 |  | 0.779 |  |
| 1.401500000000066 |  | 0.78 |  |
| 1.401000000000066 |  | 0.78 |  |
| 1.400500000000066 |  | 0.781 |  |
| 1.400000000000066 |  | 0.781 |  |
| 1.399500000000066 |  | 0.782 |  |
| 1.399000000000066 |  | 0.782 |  |
| 1.398500000000066 |  | 0.783 |  |
| 1.398000000000066 |  | 0.784 |  |
| 1.397500000000066 |  | 0.784 |  |
| 1.397000000000066 |  | 0.785 |  |
| 1.396500000000066 |  | 0.785 |  |
| 1.396000000000066 |  | 0.786 |  |
| 1.395500000000067 |  | 0.787 |  |
| 1.395000000000067 |  | 0.787 |  |
| 1.394500000000067 |  | 0.788 |  |
| 1.394000000000067 |  | 0.788 |  |
| 1.393500000000067 |  | 0.789 |  |
| 1.393000000000067 |  | 0.79 |  |
| 1.392500000000067 |  | 0.79 |  |
| 1.392000000000067 |  | 0.791 |  |
| 1.391500000000067 |  | 0.791 |  |
| 1.391000000000067 |  | 0.792 |  |
| 1.390500000000067 |  | 0.793 |  |
| 1.390000000000067 |  | 0.793 |  |
| 1.389500000000067 |  | 0.794 |  |
| 1.389000000000067 |  | 0.794 |  |
| 1.388500000000067 |  | 0.795 |  |
| 1.388000000000067 |  | 0.795 |  |
| 1.387500000000067 |  | 0.796 |  |
| 1.387000000000067 |  | 0.797 |  |
| 1.386500000000068 |  | 0.797 |  |
| 1.386000000000068 |  | 0.798 |  |
| 1.385500000000068 |  | 0.798 |  |
| 1.385000000000068 |  | 0.799 |  |
| 1.384500000000068 |  | 0.8 |  |
| 1.384000000000068 |  | 0.8 |  |
| 1.383500000000068 |  | 0.801 |  |
| 1.383000000000068 |  | 0.801 |  |
| 1.382500000000068 |  | 0.802 |  |
| 1.382000000000068 |  | 0.803 |  |
| 1.381500000000068 |  | 0.803 |  |
| 1.381000000000068 |  | 0.804 |  |
| 1.380500000000068 |  | 0.804 |  |
| 1.380000000000068 |  | 0.805 |  |
| 1.379500000000068 |  | 0.805 |  |
| 1.379000000000068 |  | 0.806 |  |
| 1.378500000000068 |  | 0.807 |  |
| 1.378000000000068 |  | 0.807 |  |
| 1.377500000000069 |  | 0.808 |  |
| 1.377000000000069 |  | 0.808 |  |
| 1.376500000000069 |  | 0.809 |  |
| 1.376000000000069 |  | 0.81 |  |
| 1.375500000000069 |  | 0.81 |  |
| 1.375000000000069 |  | 0.811 |  |
| 1.374500000000069 |  | 0.811 |  |
| 1.374000000000069 |  | 0.812 |  |
| 1.373500000000069 |  | 0.812 |  |
| 1.37300000000007 |  | 0.813 |  |
| 1.37250000000007 |  | 0.814 |  |
| 1.37200000000007 |  | 0.814 |  |
| 1.371500000000069 |  | 0.815 |  |
| 1.371000000000069 |  | 0.815 |  |
| 1.370500000000069 |  | 0.816 |  |
| 1.370000000000069 |  | 0.817 |  |
| 1.369500000000069 |  | 0.817 |  |
| 1.369000000000069 |  | 0.818 |  |
| 1.368500000000069 |  | 0.818 |  |
| 1.36800000000007 |  | 0.819 |  |
| 1.36750000000007 |  | 0.82 |  |
| 1.36700000000007 |  | 0.82 |  |
| 1.36650000000007 |  | 0.821 |  |
| 1.36600000000007 |  | 0.821 |  |
| 1.36550000000007 |  | 0.822 |  |
| 1.36500000000007 |  | 0.822 |  |
| 1.36450000000007 |  | 0.823 |  |
| 1.36400000000007 |  | 0.824 |  |
| 1.36350000000007 |  | 0.824 |  |
| 1.36300000000007 |  | 0.825 |  |
| 1.36250000000007 |  | 0.825 |  |
| 1.36200000000007 |  | 0.826 |  |
| 1.36150000000007 |  | 0.827 |  |
| 1.36100000000007 |  | 0.827 |  |
| 1.36050000000007 |  | 0.828 |  |
| 1.36000000000007 |  | 0.828 |  |
| 1.35950000000007 |  | 0.829 |  |
| 1.359000000000071 |  | 0.829 |  |
| 1.358500000000071 |  | 0.83 |  |
| 1.358000000000071 |  | 0.831 |  |
| 1.357500000000071 |  | 0.831 |  |
| 1.357000000000071 |  | 0.832 |  |
| 1.356500000000071 |  | 0.832 |  |
| 1.356000000000071 |  | 0.833 |  |
| 1.355500000000071 |  | 0.834 |  |
| 1.355000000000071 |  | 0.834 |  |
| 1.354500000000071 |  | 0.835 |  |
| 1.354000000000071 |  | 0.835 |  |
| 1.353500000000071 |  | 0.836 |  |
| 1.353000000000071 |  | 0.836 |  |
| 1.352500000000071 |  | 0.837 |  |
| 1.352000000000071 |  | 0.838 |  |
| 1.351500000000071 |  | 0.838 |  |
| 1.351000000000071 |  | 0.839 |  |
| 1.350500000000071 |  | 0.839 |  |
| 1.350000000000072 |  | 0.84 |  |
| 1.349500000000072 |  | 0.84 |  |
| 1.349000000000072 |  | 0.841 |  |
| 1.348500000000072 |  | 0.842 |  |
| 1.348000000000072 |  | 0.842 |  |
| 1.347500000000072 |  | 0.843 |  |
| 1.347000000000072 |  | 0.843 |  |
| 1.346500000000072 |  | 0.844 |  |
| 1.346000000000072 |  | 0.845 |  |
| 1.345500000000072 |  | 0.845 |  |
| 1.345000000000072 |  | 0.846 |  |
| 1.344500000000072 |  | 0.846 |  |
| 1.344000000000072 |  | 0.847 |  |
| 1.343500000000072 |  | 0.847 |  |
| 1.343000000000072 |  | 0.848 |  |
| 1.342500000000072 |  | 0.849 |  |
| 1.342000000000072 |  | 0.849 |  |
| 1.341500000000072 |  | 0.85 |  |
| 1.341000000000073 |  | 0.85 |  |
| 1.340500000000073 |  | 0.851 |  |
| 1.340000000000073 |  | 0.852 |  |
| 1.339500000000073 |  | 0.852 |  |
| 1.339000000000073 |  | 0.853 |  |
| 1.338500000000073 |  | 0.853 |  |
| 1.338000000000073 |  | 0.854 |  |
| 1.337500000000073 |  | 0.854 |  |
| 1.337000000000073 |  | 0.855 |  |
| 1.336500000000073 |  | 0.856 |  |
| 1.336000000000073 |  | 0.856 |  |
| 1.335500000000073 |  | 0.857 |  |
| 1.335000000000073 |  | 0.857 |  |
| 1.334500000000073 |  | 0.858 |  |
| 1.334000000000073 |  | 0.858 |  |
| 1.333500000000073 |  | 0.859 |  |
| 1.333000000000073 |  | 0.86 |  |
| 1.332500000000073 |  | 0.86 |  |
| 1.332000000000074 |  | 0.861 |  |
| 1.331500000000074 |  | 0.861 |  |
| 1.331000000000074 |  | 0.862 |  |
| 1.330500000000074 |  | 0.862 |  |
| 1.330000000000074 |  | 0.863 |  |
| 1.329500000000074 |  | 0.864 |  |
| 1.329000000000074 |  | 0.864 |  |
| 1.328500000000074 |  | 0.865 |  |
| 1.328000000000074 |  | 0.865 |  |
| 1.327500000000074 |  | 0.866 |  |
| 1.327000000000074 |  | 0.867 |  |
| 1.326500000000074 |  | 0.867 |  |
| 1.326000000000074 |  | 0.868 |  |
| 1.325500000000074 |  | 0.868 |  |
| 1.325000000000074 |  | 0.869 |  |
| 1.324500000000074 |  | 0.869 |  |
| 1.324000000000074 |  | 0.87 |  |
| 1.323500000000074 |  | 0.871 |  |
| 1.323000000000075 |  | 0.871 |  |
| 1.322500000000075 |  | 0.872 |  |
| 1.322000000000075 |  | 0.872 |  |
| 1.321500000000075 |  | 0.873 |  |
| 1.321000000000075 |  | 0.873 |  |
| 1.320500000000075 |  | 0.874 |  |
| 1.320000000000075 |  | 0.875 |  |
| 1.319500000000075 |  | 0.875 |  |
| 1.319000000000075 |  | 0.876 |  |
| 1.318500000000075 |  | 0.876 |  |
| 1.318000000000075 |  | 0.877 |  |
| 1.317500000000075 |  | 0.877 |  |
| 1.317000000000075 |  | 0.878 |  |
| 1.316500000000075 |  | 0.879 |  |
| 1.316000000000075 |  | 0.879 |  |
| 1.315500000000075 |  | 0.88 |  |
| 1.315000000000075 |  | 0.88 |  |
| 1.314500000000075 |  | 0.881 |  |
| 1.314000000000076 |  | 0.881 |  |
| 1.313500000000076 |  | 0.882 |  |
| 1.313000000000076 |  | 0.883 |  |
| 1.312500000000076 |  | 0.883 |  |
| 1.312000000000076 |  | 0.884 |  |
| 1.311500000000076 |  | 0.884 |  |
| 1.311000000000076 |  | 0.885 |  |
| 1.310500000000076 |  | 0.885 |  |
| 1.310000000000076 |  | 0.886 |  |
| 1.309500000000076 |  | 0.887 |  |
| 1.309000000000076 |  | 0.887 |  |
| 1.308500000000076 |  | 0.888 |  |
| 1.308000000000076 |  | 0.888 |  |
| 1.307500000000076 |  | 0.889 |  |
| 1.307000000000076 |  | 0.889 |  |
| 1.306500000000076 |  | 0.89 |  |
| 1.306000000000076 |  | 0.891 |  |
| 1.305500000000076 |  | 0.891 |  |
| 1.305000000000076 |  | 0.892 |  |
| 1.304500000000077 |  | 0.892 |  |
| 1.304000000000077 |  | 0.893 |  |
| 1.303500000000077 |  | 0.893 |  |
| 1.303000000000077 |  | 0.894 |  |
| 1.302500000000077 |  | 0.895 |  |
| 1.302000000000077 |  | 0.895 |  |
| 1.301500000000077 |  | 0.896 |  |
| 1.301000000000077 |  | 0.896 |  |
| 1.300500000000077 |  | 0.897 |  |
| 1.300000000000077 |  | 0.897 |  |
| 1.299500000000077 |  | 0.898 |  |
| 1.299000000000077 |  | 0.899 |  |
| 1.298500000000077 |  | 0.899 |  |
| 1.298000000000077 |  | 0.9 |  |
| 1.297500000000077 |  | 0.9 |  |
| 1.297000000000077 |  | 0.901 |  |
| 1.296500000000077 |  | 0.901 |  |
| 1.296000000000077 |  | 0.902 |  |
| 1.295500000000078 |  | 0.903 |  |
| 1.295000000000078 |  | 0.903 |  |
| 1.294500000000078 |  | 0.904 |  |
| 1.294000000000078 |  | 0.904 |  |
| 1.293500000000078 |  | 0.905 |  |
| 1.293000000000078 |  | 0.905 |  |
| 1.292500000000078 |  | 0.906 |  |
| 1.292000000000078 |  | 0.907 |  |
| 1.291500000000078 |  | 0.907 |  |
| 1.291000000000078 |  | 0.908 |  |
| 1.290500000000078 |  | 0.908 |  |
| 1.290000000000078 |  | 0.909 |  |
| 1.289500000000078 |  | 0.909 |  |
| 1.289000000000078 |  | 0.91 |  |
| 1.288500000000078 |  | 0.911 |  |
| 1.288000000000078 |  | 0.911 |  |
| 1.287500000000078 |  | 0.912 |  |
| 1.287000000000078 |  | 0.912 |  |
| 1.286500000000079 |  | 0.913 |  |
| 1.286000000000079 |  | 0.913 |  |
| 1.285500000000079 |  | 0.914 |  |
| 1.285000000000079 |  | 0.915 |  |
| 1.284500000000079 |  | 0.915 |  |
| 1.284000000000079 |  | 0.916 |  |
| 1.283500000000079 |  | 0.916 |  |
| 1.283000000000079 |  | 0.917 |  |
| 1.282500000000079 |  | 0.917 |  |
| 1.28200000000008 |  | 0.918 |  |
| 1.281500000000079 |  | 0.918 |  |
| 1.281000000000079 |  | 0.919 |  |
| 1.280500000000079 |  | 0.92 |  |
| 1.280000000000079 |  | 0.92 |  |
| 1.279500000000079 |  | 0.921 |  |
| 1.279000000000079 |  | 0.921 |  |
| 1.278500000000079 |  | 0.922 |  |
| 1.278000000000079 |  | 0.922 |  |
| 1.27750000000008 |  | 0.923 |  |
| 1.27700000000008 |  | 0.924 |  |
| 1.27650000000008 |  | 0.924 |  |
| 1.27600000000008 |  | 0.925 |  |
| 1.27550000000008 |  | 0.925 |  |
| 1.27500000000008 |  | 0.926 |  |
| 1.27450000000008 |  | 0.926 |  |
| 1.27400000000008 |  | 0.927 |  |
| 1.27350000000008 |  | 0.928 |  |
| 1.27300000000008 |  | 0.928 |  |
| 1.27250000000008 |  | 0.929 |  |
| 1.27200000000008 |  | 0.929 |  |
| 1.27150000000008 |  | 0.93 |  |
| 1.27100000000008 |  | 0.93 |  |
| 1.27050000000008 |  | 0.931 |  |
| 1.27000000000008 |  | 0.931 |  |
| 1.26950000000008 |  | 0.932 |  |
| 1.26900000000008 |  | 0.933 |  |
| 1.268500000000081 |  | 0.933 |  |
| 1.268000000000081 |  | 0.934 |  |
| 1.267500000000081 |  | 0.934 |  |
| 1.267000000000081 |  | 0.935 |  |
| 1.266500000000081 |  | 0.935 |  |
| 1.266000000000081 |  | 0.936 |  |
| 1.265500000000081 |  | 0.937 |  |
| 1.265000000000081 |  | 0.937 |  |
| 1.264500000000081 |  | 0.938 |  |
| 1.264000000000081 |  | 0.938 |  |
| 1.263500000000081 |  | 0.939 |  |
| 1.263000000000081 |  | 0.939 |  |
| 1.262500000000081 |  | 0.94 |  |
| 1.262000000000081 |  | 0.94 |  |
| 1.261500000000081 |  | 0.941 |  |
| 1.261000000000081 |  | 0.942 |  |
| 1.260500000000081 |  | 0.942 |  |
| 1.260000000000081 |  | 0.943 |  |
| 1.259500000000082 |  | 0.943 |  |
| 1.259000000000082 |  | 0.944 |  |
| 1.258500000000082 |  | 0.944 |  |
| 1.258000000000082 |  | 0.945 |  |
| 1.257500000000082 |  | 0.946 |  |
| 1.257000000000082 |  | 0.946 |  |
| 1.256500000000082 |  | 0.947 |  |
| 1.256000000000082 |  | 0.947 |  |
| 1.255500000000082 |  | 0.948 |  |
| 1.255000000000082 |  | 0.948 |  |
| 1.254500000000082 |  | 0.949 |  |
| 1.254000000000082 |  | 0.949 |  |
| 1.253500000000082 |  | 0.95 |  |
| 1.253000000000082 |  | 0.951 |  |
| 1.252500000000082 |  | 0.951 |  |
| 1.252000000000082 |  | 0.952 |  |
| 1.251500000000082 |  | 0.952 |  |
| 1.251000000000082 |  | 0.953 |  |
| 1.250500000000083 |  | 0.953 |  |
| 1.250000000000083 |  | 0.954 |  |
| 1.249500000000083 |  | 0.954 |  |
| 1.249000000000083 |  | 0.955 |  |
| 1.248500000000083 |  | 0.956 |  |
| 1.248000000000083 |  | 0.956 |  |
| 1.247500000000083 |  | 0.957 |  |
| 1.247000000000083 |  | 0.957 |  |
| 1.246500000000083 |  | 0.958 |  |
| 1.246000000000083 |  | 0.958 |  |
| 1.245500000000083 |  | 0.959 |  |
| 1.245000000000083 |  | 0.96 |  |
| 1.244500000000083 |  | 0.96 |  |
| 1.244000000000083 |  | 0.961 |  |
| 1.243500000000083 |  | 0.961 |  |
| 1.243000000000083 |  | 0.962 |  |
| 1.242500000000083 |  | 0.962 |  |
| 1.242000000000083 |  | 0.963 |  |
| 1.241500000000084 |  | 0.963 |  |
| 1.241000000000084 |  | 0.964 |  |
| 1.240500000000084 |  | 0.965 |  |
| 1.240000000000084 |  | 0.965 |  |
| 1.239500000000084 |  | 0.966 |  |
| 1.239000000000084 |  | 0.966 |  |
| 1.238500000000084 |  | 0.967 |  |
| 1.238000000000084 |  | 0.967 |  |
| 1.237500000000084 |  | 0.968 |  |
| 1.237000000000084 |  | 0.968 |  |
| 1.236500000000084 |  | 0.969 |  |
| 1.236000000000084 |  | 0.97 |  |
| 1.235500000000084 |  | 0.97 |  |
| 1.235000000000084 |  | 0.971 |  |
| 1.234500000000084 |  | 0.971 |  |
| 1.234000000000084 |  | 0.972 |  |
| 1.233500000000084 |  | 0.972 |  |
| 1.233000000000084 |  | 0.973 |  |
| 1.232500000000085 |  | 0.973 |  |
| 1.232000000000085 |  | 0.974 |  |
| 1.231500000000085 |  | 0.975 |  |
| 1.231000000000085 |  | 0.975 |  |
| 1.230500000000085 |  | 0.976 |  |
| 1.230000000000085 |  | 0.976 |  |
| 1.229500000000085 |  | 0.977 |  |
| 1.229000000000085 |  | 0.977 |  |
| 1.228500000000085 |  | 0.978 |  |
| 1.228000000000085 |  | 0.978 |  |
| 1.227500000000085 |  | 0.979 |  |
| 1.227000000000085 |  | 0.98 |  |
| 1.226500000000085 |  | 0.98 |  |
| 1.226000000000085 |  | 0.981 |  |
| 1.225500000000085 |  | 0.981 |  |
| 1.225000000000085 |  | 0.982 |  |
| 1.224500000000085 |  | 0.982 |  |
| 1.224000000000085 |  | 0.983 |  |
| 1.223500000000086 |  | 0.983 |  |
| 1.223000000000086 |  | 0.984 |  |
| 1.222500000000086 |  | 0.984 |  |
| 1.222000000000086 |  | 0.985 |  |
| 1.221500000000086 |  | 0.986 |  |
| 1.221000000000086 |  | 0.986 |  |
| 1.220500000000086 |  | 0.987 |  |
| 1.220000000000086 |  | 0.987 |  |
| 1.219500000000086 |  | 0.988 |  |
| 1.219000000000086 |  | 0.988 |  |
| 1.218500000000086 |  | 0.989 |  |
| 1.218000000000086 |  | 0.989 |  |
| 1.217500000000086 |  | 0.99 |  |
| 1.217000000000086 |  | 0.991 |  |
| 1.216500000000086 |  | 0.991 |  |
| 1.216000000000086 |  | 0.992 |  |
| 1.215500000000086 |  | 0.992 |  |
| 1.215000000000086 |  | 0.993 |  |
| 1.214500000000086 |  | 0.993 |  |
| 1.214000000000087 |  | 0.994 |  |
| 1.213500000000087 |  | 0.994 |  |
| 1.213000000000087 |  | 0.995 |  |
| 1.212500000000087 |  | 0.996 |  |
| 1.212000000000087 |  | 0.996 |  |
| 1.211500000000087 |  | 0.997 |  |
| 1.211000000000087 |  | 0.997 |  |
| 1.210500000000087 |  | 0.998 |  |
| 1.210000000000087 |  | 0.998 |  |
| 1.209500000000087 |  | 0.999 |  |
| 1.209000000000087 |  | 0.999 |  |
| 1.208500000000087 |  | 1 |  |
| 1.208000000000087 |  | 1 |  |
| 1.207500000000087 |  | 1.001 |  |
| 1.207000000000087 |  | 1.002 |  |
| 1.206500000000087 |  | 1.002 |  |
| 1.206000000000087 |  | 1.003 |  |
| 1.205500000000087 |  | 1.003 |  |
| 1.205000000000088 |  | 1.004 |  |
| 1.204500000000088 |  | 1.004 |  |
| 1.204000000000088 |  | 1.005 |  |
| 1.203500000000088 |  | 1.005 |  |
| 1.203000000000088 |  | 1.006 |  |
| 1.202500000000088 |  | 1.007 |  |
| 1.202000000000088 |  | 1.007 |  |
| 1.201500000000088 |  | 1.008 |  |
| 1.201000000000088 |  | 1.008 |  |
| 1.200500000000088 |  | 1.009 |  |
| 1.200000000000088 |  | 1.009 |  |
| 1.199500000000088 |  | 1.01 |  |
| 1.199000000000088 |  | 1.01 |  |
| 1.198500000000088 |  | 1.011 |  |
| 1.198000000000088 |  | 1.011 |  |
| 1.197500000000088 |  | 1.012 |  |
| 1.197000000000088 |  | 1.013 |  |
| 1.196500000000088 |  | 1.013 |  |
| 1.196000000000089 |  | 1.014 |  |
| 1.195500000000089 |  | 1.014 |  |
| 1.195000000000089 |  | 1.015 |  |
| 1.194500000000089 |  | 1.015 |  |
| 1.194000000000089 |  | 1.016 |  |
| 1.193500000000089 |  | 1.016 |  |
| 1.193000000000089 |  | 1.017 |  |
| 1.192500000000089 |  | 1.017 |  |
| 1.192000000000089 |  | 1.018 |  |
| 1.19150000000009 |  | 1.019 |  |
| 1.19100000000009 |  | 1.019 |  |
| 1.19050000000009 |  | 1.02 |  |
| 1.19000000000009 |  | 1.02 |  |
| 1.189500000000089 |  | 1.021 |  |
| 1.189000000000089 |  | 1.021 |  |
| 1.188500000000089 |  | 1.022 |  |
| 1.188000000000089 |  | 1.022 |  |
| 1.187500000000089 |  | 1.023 |  |
| 1.18700000000009 |  | 1.023 |  |
| 1.18650000000009 |  | 1.024 |  |
| 1.18600000000009 |  | 1.025 |  |
| 1.18550000000009 |  | 1.025 |  |
| 1.18500000000009 |  | 1.026 |  |
| 1.18450000000009 |  | 1.026 |  |
| 1.18400000000009 |  | 1.027 |  |
| 1.18350000000009 |  | 1.027 |  |
| 1.18300000000009 |  | 1.028 |  |
| 1.18250000000009 |  | 1.028 |  |
| 1.18200000000009 |  | 1.029 |  |
| 1.18150000000009 |  | 1.029 |  |
| 1.18100000000009 |  | 1.03 |  |
| 1.18050000000009 |  | 1.031 |  |
| 1.18000000000009 |  | 1.031 |  |
| 1.17950000000009 |  | 1.032 |  |
| 1.17900000000009 |  | 1.032 |  |
| 1.17850000000009 |  | 1.033 |  |
| 1.178000000000091 |  | 1.033 |  |
| 1.177500000000091 |  | 1.034 |  |
| 1.177000000000091 |  | 1.034 |  |
| 1.176500000000091 |  | 1.035 |  |
| 1.176000000000091 |  | 1.035 |  |
| 1.175500000000091 |  | 1.036 |  |
| 1.175000000000091 |  | 1.037 |  |
| 1.174500000000091 |  | 1.037 |  |
| 1.174000000000091 |  | 1.038 |  |
| 1.173500000000091 |  | 1.038 |  |
| 1.173000000000091 |  | 1.039 |  |
| 1.172500000000091 |  | 1.039 |  |
| 1.172000000000091 |  | 1.04 |  |
| 1.171500000000091 |  | 1.04 |  |
| 1.171000000000091 |  | 1.041 |  |
| 1.170500000000091 |  | 1.041 |  |
| 1.170000000000091 |  | 1.042 |  |
| 1.169500000000091 |  | 1.042 |  |
| 1.169000000000092 |  | 1.043 |  |
| 1.168500000000092 |  | 1.044 |  |
| 1.168000000000092 |  | 1.044 |  |
| 1.167500000000092 |  | 1.045 |  |
| 1.167000000000092 |  | 1.045 |  |
| 1.166500000000092 |  | 1.046 |  |
| 1.166000000000092 |  | 1.046 |  |
| 1.165500000000092 |  | 1.047 |  |
| 1.165000000000092 |  | 1.047 |  |
| 1.164500000000092 |  | 1.048 |  |
| 1.164000000000092 |  | 1.048 |  |
| 1.163500000000092 |  | 1.049 |  |
| 1.163000000000092 |  | 1.049 |  |
| 1.162500000000092 |  | 1.05 |  |
| 1.162000000000092 |  | 1.051 |  |
| 1.161500000000092 |  | 1.051 |  |
| 1.161000000000092 |  | 1.052 |  |
| 1.160500000000092 |  | 1.052 |  |
| 1.160000000000092 |  | 1.053 |  |
| 1.159500000000093 |  | 1.053 |  |
| 1.159000000000093 |  | 1.054 |  |
| 1.158500000000093 |  | 1.054 |  |
| 1.158000000000093 |  | 1.055 |  |
| 1.157500000000093 |  | 1.055 |  |
| 1.157000000000093 |  | 1.056 |  |
| 1.156500000000093 |  | 1.056 |  |
| 1.156000000000093 |  | 1.057 |  |
| 1.155500000000093 |  | 1.058 |  |
| 1.155000000000093 |  | 1.058 |  |
| 1.154500000000093 |  | 1.059 |  |
| 1.154000000000093 |  | 1.059 |  |
| 1.153500000000093 |  | 1.06 |  |
| 1.153000000000093 |  | 1.06 |  |
| 1.152500000000093 |  | 1.061 |  |
| 1.152000000000093 |  | 1.061 |  |
| 1.151500000000093 |  | 1.062 |  |
| 1.151000000000093 |  | 1.062 |  |
| 1.150500000000094 |  | 1.063 |  |
| 1.150000000000094 |  | 1.063 |  |
| 1.149500000000094 |  | 1.064 |  |
| 1.149000000000094 |  | 1.065 |  |
| 1.148500000000094 |  | 1.065 |  |
| 1.148000000000094 |  | 1.066 |  |
| 1.147500000000094 |  | 1.066 |  |
| 1.147000000000094 |  | 1.067 |  |
| 1.146500000000094 |  | 1.067 |  |
| 1.146000000000094 |  | 1.068 |  |
| 1.145500000000094 |  | 1.068 |  |
| 1.145000000000094 |  | 1.069 |  |
| 1.144500000000094 |  | 1.069 |  |
| 1.144000000000094 |  | 1.07 |  |
| 1.143500000000094 |  | 1.07 |  |
| 1.143000000000094 |  | 1.071 |  |
| 1.142500000000094 |  | 1.071 |  |
| 1.142000000000094 |  | 1.072 |  |
| 1.141500000000095 |  | 1.073 |  |
| 1.141000000000095 |  | 1.073 |  |
| 1.140500000000095 |  | 1.074 |  |
| 1.140000000000095 |  | 1.074 |  |
| 1.139500000000095 |  | 1.075 |  |
| 1.139000000000095 |  | 1.075 |  |
| 1.138500000000095 |  | 1.076 |  |
| 1.138000000000095 |  | 1.076 |  |
| 1.137500000000095 |  | 1.077 |  |
| 1.137000000000095 |  | 1.077 |  |
| 1.136500000000095 |  | 1.078 |  |
| 1.136000000000095 |  | 1.078 |  |
| 1.135500000000095 |  | 1.079 |  |
| 1.135000000000095 |  | 1.079 |  |
| 1.134500000000095 |  | 1.08 |  |
| 1.134000000000095 |  | 1.081 |  |
| 1.133500000000095 |  | 1.081 |  |
| 1.133000000000095 |  | 1.082 |  |
| 1.132500000000096 |  | 1.082 |  |
| 1.132000000000096 |  | 1.083 |  |
| 1.131500000000096 |  | 1.083 |  |
| 1.131000000000096 |  | 1.084 |  |
| 1.130500000000096 |  | 1.084 |  |
| 1.130000000000096 |  | 1.085 |  |
| 1.129500000000096 |  | 1.085 |  |
| 1.129000000000096 |  | 1.086 |  |
| 1.128500000000096 |  | 1.086 |  |
| 1.128000000000096 |  | 1.087 |  |
| 1.127500000000096 |  | 1.087 |  |
| 1.127000000000096 |  | 1.088 |  |
| 1.126500000000096 |  | 1.089 |  |
| 1.126000000000096 |  | 1.089 |  |
| 1.125500000000096 |  | 1.09 |  |
| 1.125000000000096 |  | 1.09 |  |
| 1.124500000000096 |  | 1.091 |  |
| 1.124000000000096 |  | 1.091 |  |
| 1.123500000000097 |  | 1.092 |  |
| 1.123000000000097 |  | 1.092 |  |
| 1.122500000000097 |  | 1.093 |  |
| 1.122000000000097 |  | 1.093 |  |
| 1.121500000000097 |  | 1.094 |  |
| 1.121000000000097 |  | 1.094 |  |
| 1.120500000000097 |  | 1.095 |  |
| 1.120000000000097 |  | 1.095 |  |
| 1.119500000000097 |  | 1.096 |  |
| 1.119000000000097 |  | 1.096 |  |
| 1.118500000000097 |  | 1.097 |  |
| 1.118000000000097 |  | 1.098 |  |
| 1.117500000000097 |  | 1.098 |  |
| 1.117000000000097 |  | 1.099 |  |
| 1.116500000000097 |  | 1.099 |  |
| 1.116000000000097 |  | 1.1 |  |
| 1.115500000000097 |  | 1.1 |  |
| 1.115000000000097 |  | 1.101 |  |
| 1.114500000000098 |  | 1.101 |  |
| 1.114000000000098 |  | 1.102 |  |
| 1.113500000000098 |  | 1.102 |  |
| 1.113000000000098 |  | 1.103 |  |
| 1.112500000000098 |  | 1.103 |  |
| 1.112000000000098 |  | 1.104 |  |
| 1.111500000000098 |  | 1.104 |  |
| 1.111000000000098 |  | 1.105 |  |
| 1.110500000000098 |  | 1.105 |  |
| 1.110000000000098 |  | 1.106 |  |
| 1.109500000000098 |  | 1.107 |  |
| 1.109000000000098 |  | 1.107 |  |
| 1.108500000000098 |  | 1.108 |  |
| 1.108000000000098 |  | 1.108 |  |
| 1.107500000000098 |  | 1.109 |  |
| 1.107000000000098 |  | 1.109 |  |
| 1.106500000000098 |  | 1.11 |  |
| 1.106000000000098 |  | 1.11 |  |
| 1.105500000000099 |  | 1.111 |  |
| 1.105000000000099 |  | 1.111 |  |
| 1.104500000000099 |  | 1.112 |  |
| 1.104000000000099 |  | 1.112 |  |
| 1.103500000000099 |  | 1.113 |  |
| 1.103000000000099 |  | 1.113 |  |
| 1.102500000000099 |  | 1.114 |  |
| 1.102000000000099 |  | 1.114 |  |
| 1.101500000000099 |  | 1.115 |  |
| 1.1010000000001 |  | 1.115 |  |
| 1.1005000000001 |  | 1.116 |  |
| 1.1000000000001 |  | 1.116 |  |
| 1.099500000000099 |  | 1.117 |  |
| 1.099000000000099 |  | 1.118 |  |
| 1.098500000000099 |  | 1.118 |  |
| 1.098000000000099 |  | 1.119 |  |
| 1.097500000000099 |  | 1.119 |  |
| 1.097000000000099 |  | 1.12 |  |
| 1.096500000000099 |  | 1.12 |  |
| 1.0960000000001 |  | 1.121 |  |
| 1.0955000000001 |  | 1.121 |  |
| 1.0950000000001 |  | 1.122 |  |
| 1.0945000000001 |  | 1.122 |  |
| 1.0940000000001 |  | 1.123 |  |
| 1.0935000000001 |  | 1.123 |  |
| 1.0930000000001 |  | 1.124 |  |
| 1.0925000000001 |  | 1.124 |  |
| 1.0920000000001 |  | 1.125 |  |
| 1.0915000000001 |  | 1.125 |  |
| 1.0910000000001 |  | 1.126 |  |
| 1.0905000000001 |  | 1.126 |  |
| 1.0900000000001 |  | 1.127 |  |
| 1.0895000000001 |  | 1.127 |  |
| 1.0890000000001 |  | 1.128 |  |
| 1.0885000000001 |  | 1.129 |  |
| 1.0880000000001 |  | 1.129 |  |
| 1.0875000000001 |  | 1.13 |  |
| 1.087000000000101 |  | 1.13 |  |
| 1.086500000000101 |  | 1.131 |  |
| 1.086000000000101 |  | 1.131 |  |
| 1.085500000000101 |  | 1.132 |  |
| 1.085000000000101 |  | 1.132 |  |
| 1.084500000000101 |  | 1.133 |  |
| 1.084000000000101 |  | 1.133 |  |
| 1.083500000000101 |  | 1.134 |  |
| 1.083000000000101 |  | 1.134 |  |
| 1.082500000000101 |  | 1.135 |  |
| 1.082000000000101 |  | 1.135 |  |
| 1.081500000000101 |  | 1.136 |  |
| 1.081000000000101 |  | 1.136 |  |
| 1.080500000000101 |  | 1.137 |  |
| 1.080000000000101 |  | 1.137 |  |
| 1.079500000000101 |  | 1.138 |  |
| 1.079000000000101 |  | 1.138 |  |
| 1.078500000000101 |  | 1.139 |  |
| 1.078000000000102 |  | 1.139 |  |
| 1.077500000000102 |  | 1.14 |  |
| 1.077000000000102 |  | 1.14 |  |
| 1.076500000000102 |  | 1.141 |  |
| 1.076000000000102 |  | 1.142 |  |
| 1.075500000000102 |  | 1.142 |  |
| 1.075000000000102 |  | 1.143 |  |
| 1.074500000000102 |  | 1.143 |  |
| 1.074000000000102 |  | 1.144 |  |
| 1.073500000000102 |  | 1.144 |  |
| 1.073000000000102 |  | 1.145 |  |
| 1.072500000000102 |  | 1.145 |  |
| 1.072000000000102 |  | 1.146 |  |
| 1.071500000000102 |  | 1.146 |  |
| 1.071000000000102 |  | 1.147 |  |
| 1.070500000000102 |  | 1.147 |  |
| 1.070000000000102 |  | 1.148 |  |
| 1.069500000000102 |  | 1.148 |  |
| 1.069000000000103 |  | 1.149 |  |
| 1.068500000000103 |  | 1.149 |  |
| 1.068000000000103 |  | 1.15 |  |
| 1.067500000000103 |  | 1.15 |  |
| 1.067000000000103 |  | 1.151 |  |
| 1.066500000000103 |  | 1.151 |  |
| 1.066000000000103 |  | 1.152 |  |
| 1.065500000000103 |  | 1.152 |  |
| 1.065000000000103 |  | 1.153 |  |
| 1.064500000000103 |  | 1.153 |  |
| 1.064000000000103 |  | 1.154 |  |
| 1.063500000000103 |  | 1.154 |  |
| 1.063000000000103 |  | 1.155 |  |
| 1.062500000000103 |  | 1.155 |  |
| 1.062000000000103 |  | 1.156 |  |
| 1.061500000000103 |  | 1.157 |  |
| 1.061000000000103 |  | 1.157 |  |
| 1.060500000000103 |  | 1.158 |  |
| 1.060000000000104 |  | 1.158 |  |
| 1.059500000000104 |  | 1.159 |  |
| 1.059000000000104 |  | 1.159 |  |
| 1.058500000000104 |  | 1.16 |  |
| 1.058000000000104 |  | 1.16 |  |
| 1.057500000000104 |  | 1.161 |  |
| 1.057000000000104 |  | 1.161 |  |
| 1.056500000000104 |  | 1.162 |  |
| 1.056000000000104 |  | 1.162 |  |
| 1.055500000000104 |  | 1.163 |  |
| 1.055000000000104 |  | 1.163 |  |
| 1.054500000000104 |  | 1.164 |  |
| 1.054000000000104 |  | 1.164 |  |
| 1.053500000000104 |  | 1.165 |  |
| 1.053000000000104 |  | 1.165 |  |
| 1.052500000000104 |  | 1.166 |  |
| 1.052000000000104 |  | 1.166 |  |
| 1.051500000000104 |  | 1.167 |  |
| 1.051000000000105 |  | 1.167 |  |
| 1.050500000000105 |  | 1.168 |  |
| 1.050000000000105 |  | 1.168 |  |
| 1.049500000000105 |  | 1.169 |  |
| 1.049000000000105 |  | 1.169 |  |
| 1.048500000000105 |  | 1.17 |  |
| 1.048000000000105 |  | 1.17 |  |
| 1.047500000000105 |  | 1.171 |  |
| 1.047000000000105 |  | 1.171 |  |
| 1.046500000000105 |  | 1.172 |  |
| 1.046000000000105 |  | 1.172 |  |
| 1.045500000000105 |  | 1.173 |  |
| 1.045000000000105 |  | 1.173 |  |
| 1.044500000000105 |  | 1.174 |  |
| 1.044000000000105 |  | 1.174 |  |
| 1.043500000000105 |  | 1.175 |  |
| 1.043000000000105 |  | 1.175 |  |
| 1.042500000000105 |  | 1.176 |  |
| 1.042000000000106 |  | 1.177 |  |
| 1.041500000000106 |  | 1.177 |  |
| 1.041000000000106 |  | 1.178 |  |
| 1.040500000000106 |  | 1.178 |  |
| 1.040000000000106 |  | 1.179 |  |
| 1.039500000000106 |  | 1.179 |  |
| 1.039000000000106 |  | 1.18 |  |
| 1.038500000000106 |  | 1.18 |  |
| 1.038000000000106 |  | 1.181 |  |
| 1.037500000000106 |  | 1.181 |  |
| 1.037000000000106 |  | 1.182 |  |
| 1.036500000000106 |  | 1.182 |  |
| 1.036000000000106 |  | 1.183 |  |
| 1.035500000000106 |  | 1.183 |  |
| 1.035000000000106 |  | 1.184 |  |
| 1.034500000000106 |  | 1.184 |  |
| 1.034000000000106 |  | 1.185 |  |
| 1.033500000000106 |  | 1.185 |  |
| 1.033000000000106 |  | 1.186 |  |
| 1.032500000000107 |  | 1.186 |  |
| 1.032000000000107 |  | 1.187 |  |
| 1.031500000000107 |  | 1.187 |  |
| 1.031000000000107 |  | 1.188 |  |
| 1.030500000000107 |  | 1.188 |  |
| 1.030000000000107 |  | 1.189 |  |
| 1.029500000000107 |  | 1.189 |  |
| 1.029000000000107 |  | 1.19 |  |
| 1.028500000000107 |  | 1.19 |  |
| 1.028000000000107 |  | 1.191 |  |
| 1.027500000000107 |  | 1.191 |  |
| 1.027000000000107 |  | 1.192 |  |
| 1.026500000000107 |  | 1.192 |  |
| 1.026000000000107 |  | 1.193 |  |
| 1.025500000000107 |  | 1.193 |  |
| 1.025000000000107 |  | 1.194 |  |
| 1.024500000000107 |  | 1.194 |  |
| 1.024000000000107 |  | 1.195 |  |
| 1.023500000000108 |  | 1.195 |  |
| 1.023000000000108 |  | 1.196 |  |
| 1.022500000000108 |  | 1.196 |  |
| 1.022000000000108 |  | 1.197 |  |
| 1.021500000000108 |  | 1.197 |  |
| 1.021000000000108 |  | 1.198 |  |
| 1.020500000000108 |  | 1.198 |  |
| 1.020000000000108 |  | 1.199 |  |
| 1.019500000000108 |  | 1.199 |  |
| 1.019000000000108 |  | 1.2 |  |
| 1.018500000000108 |  | 1.2 |  |
| 1.018000000000108 |  | 1.201 |  |
| 1.017500000000108 |  | 1.201 |  |
| 1.017000000000108 |  | 1.202 |  |
| 1.016500000000108 |  | 1.202 |  |
| 1.016000000000108 |  | 1.203 |  |
| 1.015500000000108 |  | 1.203 |  |
| 1.015000000000108 |  | 1.204 |  |
| 1.014500000000109 |  | 1.204 |  |
| 1.014000000000109 |  | 1.205 |  |
| 1.013500000000109 |  | 1.205 |  |
| 1.013000000000109 |  | 1.206 |  |
| 1.012500000000109 |  | 1.206 |  |
| 1.012000000000109 |  | 1.207 |  |
| 1.011500000000109 |  | 1.207 |  |
| 1.011000000000109 |  | 1.208 |  |
| 1.010500000000109 |  | 1.208 |  |
| 1.01000000000011 |  | 1.209 |  |
| 1.009500000000109 |  | 1.209 |  |
| 1.009000000000109 |  | 1.21 |  |
| 1.008500000000109 |  | 1.21 |  |
| 1.008000000000109 |  | 1.211 |  |
| 1.007500000000109 |  | 1.211 |  |
| 1.007000000000109 |  | 1.212 |  |
| 1.006500000000109 |  | 1.212 |  |
| 1.006000000000109 |  | 1.213 |  |
| 1.00550000000011 |  | 1.213 |  |
| 1.00500000000011 |  | 1.214 |  |
| 1.00450000000011 |  | 1.214 |  |
| 1.00400000000011 |  | 1.215 |  |
| 1.00350000000011 |  | 1.215 |  |
| 1.00300000000011 |  | 1.216 |  |
| 1.00250000000011 |  | 1.216 |  |
| 1.00200000000011 |  | 1.217 |  |
| 1.00150000000011 |  | 1.217 |  |
| 1.00100000000011 |  | 1.218 |  |
| 1.00050000000011 |  | 1.218 |  |
| 1.00000000000011 |  | 1.219 |  |